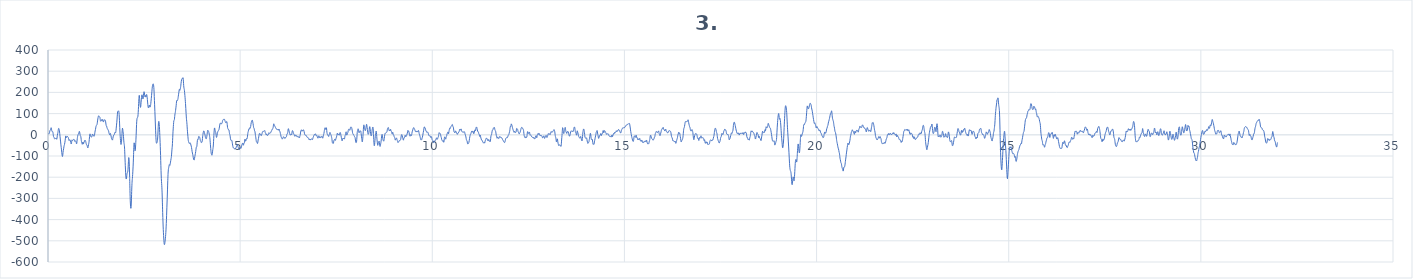
| Category | 3. kanál |
|---|---|
| 0.0 | 8.9 |
| 0.0078125 | 4.5 |
| 0.015625 | 3.4 |
| 0.0234375 | 4.8 |
| 0.03125 | 5.8 |
| 0.0390625 | 10 |
| 0.046875 | 17.3 |
| 0.0546875 | 22 |
| 0.0625 | 23.2 |
| 0.0703125 | 26.2 |
| 0.078125 | 32.6 |
| 0.0859375 | 32.5 |
| 0.09375 | 23.6 |
| 0.1015625 | 16.7 |
| 0.109375 | 14.8 |
| 0.1171875 | 15 |
| 0.125 | 14.3 |
| 0.1328125 | 6.5 |
| 0.140625 | -5.1 |
| 0.1484375 | -10.2 |
| 0.15625 | -11.9 |
| 0.1640625 | -16.3 |
| 0.171875 | -19.3 |
| 0.1796875 | -18.6 |
| 0.1875 | -17.9 |
| 0.1953125 | -17.7 |
| 0.203125 | -16.3 |
| 0.2109375 | -15.2 |
| 0.21875 | -18.2 |
| 0.2265625 | -21.1 |
| 0.234375 | -15.4 |
| 0.2421875 | -4.1 |
| 0.25 | 3.7 |
| 0.2578125 | 10.3 |
| 0.265625 | 20.6 |
| 0.2734375 | 29.1 |
| 0.28125 | 30 |
| 0.2890625 | 25.9 |
| 0.296875 | 18.6 |
| 0.3046875 | 6.9 |
| 0.3125 | -6.8 |
| 0.3203125 | -19.9 |
| 0.328125 | -33.7 |
| 0.3359375 | -47.4 |
| 0.34375 | -59.1 |
| 0.3515625 | -71.2 |
| 0.359375 | -84.5 |
| 0.3671875 | -96.1 |
| 0.375 | -102.6 |
| 0.3828125 | -97.8 |
| 0.390625 | -84 |
| 0.3984375 | -73.3 |
| 0.40625 | -66 |
| 0.4140625 | -56.6 |
| 0.421875 | -50.1 |
| 0.4296875 | -45.3 |
| 0.4375 | -37.5 |
| 0.4453125 | -28.2 |
| 0.453125 | -15.8 |
| 0.4609375 | -5.7 |
| 0.46875 | -7.7 |
| 0.4765625 | -12.8 |
| 0.484375 | -11.9 |
| 0.4921875 | -9.1 |
| 0.5 | -7.3 |
| 0.5078125 | -8 |
| 0.515625 | -10.1 |
| 0.5234375 | -10.9 |
| 0.53125 | -14.6 |
| 0.5390625 | -22.3 |
| 0.546875 | -27.1 |
| 0.5546875 | -26 |
| 0.5625 | -23.3 |
| 0.5703125 | -23.4 |
| 0.578125 | -25.6 |
| 0.5859375 | -29.1 |
| 0.59375 | -35.8 |
| 0.6015625 | -43 |
| 0.609375 | -41.6 |
| 0.6171875 | -31 |
| 0.625 | -23.9 |
| 0.6328125 | -26.1 |
| 0.640625 | -27.3 |
| 0.6484375 | -24.3 |
| 0.65625 | -22.9 |
| 0.6640625 | -22.6 |
| 0.671875 | -21.4 |
| 0.6796875 | -21.6 |
| 0.6875 | -25.5 |
| 0.6953125 | -30.5 |
| 0.703125 | -30.8 |
| 0.7109375 | -28.4 |
| 0.71875 | -28.8 |
| 0.7265625 | -31 |
| 0.734375 | -36.5 |
| 0.7421875 | -42.8 |
| 0.75 | -38.4 |
| 0.7578125 | -24.7 |
| 0.765625 | -13.1 |
| 0.7734375 | -5.5 |
| 0.78125 | 0 |
| 0.7890625 | 2.4 |
| 0.796875 | 4.1 |
| 0.8046875 | 9.3 |
| 0.8125 | 15.5 |
| 0.8203125 | 15.4 |
| 0.828125 | 8 |
| 0.8359375 | -0.6 |
| 0.84375 | -5.3 |
| 0.8515625 | -7.3 |
| 0.859375 | -15 |
| 0.8671875 | -27.7 |
| 0.875 | -34.6 |
| 0.8828125 | -38.4 |
| 0.890625 | -44.6 |
| 0.8984375 | -42.2 |
| 0.90625 | -34.2 |
| 0.9140625 | -37.5 |
| 0.921875 | -43.7 |
| 0.9296875 | -38.3 |
| 0.9375 | -33.3 |
| 0.9453125 | -34.4 |
| 0.953125 | -30.3 |
| 0.9609375 | -24.8 |
| 0.96875 | -27 |
| 0.9765625 | -30 |
| 0.984375 | -33.1 |
| 0.9921875 | -40.7 |
| 1.0 | -46 |
| 1.0078125 | -46.6 |
| 1.015625 | -49.3 |
| 1.0234375 | -54.8 |
| 1.03125 | -60.5 |
| 1.0390625 | -61.7 |
| 1.046875 | -55.2 |
| 1.0546875 | -46.7 |
| 1.0625 | -39.7 |
| 1.0703125 | -30 |
| 1.078125 | -15.1 |
| 1.0859375 | -0.8 |
| 1.09375 | 4.4 |
| 1.1015625 | 1.3 |
| 1.109375 | -4.2 |
| 1.1171875 | -9.5 |
| 1.125 | -11.1 |
| 1.1328125 | -10.1 |
| 1.140625 | -9.7 |
| 1.1484375 | -4.2 |
| 1.15625 | 3.5 |
| 1.1640625 | 2.2 |
| 1.171875 | -2.1 |
| 1.1796875 | -2.2 |
| 1.1875 | -4 |
| 1.1953125 | -6.9 |
| 1.203125 | -6 |
| 1.2109375 | -0.4 |
| 1.21875 | 9.4 |
| 1.2265625 | 18.2 |
| 1.234375 | 24.1 |
| 1.2421875 | 32.2 |
| 1.25 | 40 |
| 1.2578125 | 43.5 |
| 1.265625 | 45.3 |
| 1.2734375 | 47.7 |
| 1.28125 | 54.4 |
| 1.2890625 | 65.4 |
| 1.296875 | 74.8 |
| 1.3046875 | 82.4 |
| 1.3125 | 88.5 |
| 1.3203125 | 89.6 |
| 1.328125 | 87 |
| 1.3359375 | 84.6 |
| 1.34375 | 84.4 |
| 1.3515625 | 81.6 |
| 1.359375 | 71.5 |
| 1.3671875 | 64.3 |
| 1.375 | 65.2 |
| 1.3828125 | 64.9 |
| 1.390625 | 66.8 |
| 1.3984375 | 71.9 |
| 1.40625 | 69.6 |
| 1.4140625 | 67.6 |
| 1.421875 | 72.2 |
| 1.4296875 | 69.6 |
| 1.4375 | 61.3 |
| 1.4453125 | 60.8 |
| 1.453125 | 65.7 |
| 1.4609375 | 68.6 |
| 1.46875 | 69.9 |
| 1.4765625 | 70.8 |
| 1.484375 | 70.7 |
| 1.4921875 | 67.9 |
| 1.5 | 61.1 |
| 1.5078125 | 50.9 |
| 1.515625 | 43.6 |
| 1.5234375 | 41.7 |
| 1.53125 | 37.2 |
| 1.5390625 | 30.4 |
| 1.546875 | 29.2 |
| 1.5546875 | 26.9 |
| 1.5625 | 21.4 |
| 1.5703125 | 20.9 |
| 1.578125 | 18 |
| 1.5859375 | 9.4 |
| 1.59375 | 4.5 |
| 1.6015625 | 0.9 |
| 1.609375 | 0.6 |
| 1.6171875 | 6.4 |
| 1.625 | 5.9 |
| 1.6328125 | -0.3 |
| 1.640625 | -5.6 |
| 1.6484375 | -14 |
| 1.65625 | -19.2 |
| 1.6640625 | -19.3 |
| 1.671875 | -23.7 |
| 1.6796875 | -24.7 |
| 1.6875 | -16.8 |
| 1.6953125 | -9.6 |
| 1.703125 | -4.9 |
| 1.7109375 | -1.3 |
| 1.71875 | -0.7 |
| 1.7265625 | 1.5 |
| 1.734375 | 7.2 |
| 1.7421875 | 11.3 |
| 1.75 | 10.3 |
| 1.7578125 | 9 |
| 1.765625 | 15.2 |
| 1.7734375 | 27.9 |
| 1.78125 | 42 |
| 1.7890625 | 57 |
| 1.796875 | 74.4 |
| 1.8046875 | 94.2 |
| 1.8125 | 108.6 |
| 1.8203125 | 111.4 |
| 1.828125 | 111.2 |
| 1.8359375 | 113.2 |
| 1.84375 | 109.7 |
| 1.8515625 | 95.6 |
| 1.859375 | 68.7 |
| 1.8671875 | 33.3 |
| 1.875 | 4.1 |
| 1.8828125 | -17.2 |
| 1.890625 | -36.2 |
| 1.8984375 | -45.5 |
| 1.90625 | -42.2 |
| 1.9140625 | -30.2 |
| 1.921875 | -7.1 |
| 1.9296875 | 19 |
| 1.9375 | 31.1 |
| 1.9453125 | 26.1 |
| 1.953125 | 14.7 |
| 1.9609375 | 0.7 |
| 1.96875 | -19.3 |
| 1.9765625 | -37.1 |
| 1.984375 | -46.3 |
| 1.9921875 | -62.6 |
| 2.0 | -94.5 |
| 2.0078125 | -129.5 |
| 2.015625 | -161.6 |
| 2.0234375 | -189.7 |
| 2.03125 | -205.9 |
| 2.0390625 | -208 |
| 2.046875 | -199 |
| 2.0546875 | -185.6 |
| 2.0625 | -178.5 |
| 2.0703125 | -177.5 |
| 2.078125 | -170.5 |
| 2.0859375 | -151.7 |
| 2.09375 | -125.5 |
| 2.1015625 | -107.3 |
| 2.109375 | -115.5 |
| 2.1171875 | -150.2 |
| 2.125 | -201.7 |
| 2.1328125 | -261.9 |
| 2.140625 | -311.4 |
| 2.1484375 | -337.4 |
| 2.15625 | -346.9 |
| 2.1640625 | -337.6 |
| 2.171875 | -302.1 |
| 2.1796875 | -256 |
| 2.1875 | -223.4 |
| 2.1953125 | -206 |
| 2.203125 | -187.1 |
| 2.2109375 | -161.4 |
| 2.21875 | -132.6 |
| 2.2265625 | -93.5 |
| 2.234375 | -53.4 |
| 2.2421875 | -37.8 |
| 2.25 | -45.3 |
| 2.2578125 | -61.3 |
| 2.265625 | -75.3 |
| 2.2734375 | -70.3 |
| 2.28125 | -47.5 |
| 2.2890625 | -20.6 |
| 2.296875 | 13.3 |
| 2.3046875 | 48.7 |
| 2.3125 | 70.4 |
| 2.3203125 | 79.4 |
| 2.328125 | 81.6 |
| 2.3359375 | 83.4 |
| 2.34375 | 95.3 |
| 2.3515625 | 118.5 |
| 2.359375 | 148.3 |
| 2.3671875 | 176.6 |
| 2.375 | 186.1 |
| 2.3828125 | 173.8 |
| 2.390625 | 155.2 |
| 2.3984375 | 138.9 |
| 2.40625 | 129.3 |
| 2.4140625 | 135.4 |
| 2.421875 | 151.9 |
| 2.4296875 | 168.2 |
| 2.4375 | 182.7 |
| 2.4453125 | 188.7 |
| 2.453125 | 183.4 |
| 2.4609375 | 175.1 |
| 2.46875 | 168.9 |
| 2.4765625 | 171.8 |
| 2.484375 | 186.5 |
| 2.4921875 | 199.3 |
| 2.5 | 203.3 |
| 2.5078125 | 198.5 |
| 2.515625 | 185.5 |
| 2.5234375 | 179.6 |
| 2.53125 | 185.3 |
| 2.5390625 | 184.6 |
| 2.546875 | 177.9 |
| 2.5546875 | 181 |
| 2.5625 | 189.4 |
| 2.5703125 | 189.3 |
| 2.578125 | 180.6 |
| 2.5859375 | 166.9 |
| 2.59375 | 150.1 |
| 2.6015625 | 136.3 |
| 2.609375 | 129 |
| 2.6171875 | 126.6 |
| 2.625 | 131.1 |
| 2.6328125 | 139.1 |
| 2.640625 | 139.7 |
| 2.6484375 | 133.6 |
| 2.65625 | 130.6 |
| 2.6640625 | 133.6 |
| 2.671875 | 142.4 |
| 2.6796875 | 155.8 |
| 2.6875 | 170.6 |
| 2.6953125 | 185.9 |
| 2.703125 | 203 |
| 2.7109375 | 219.8 |
| 2.71875 | 231.5 |
| 2.7265625 | 237.8 |
| 2.734375 | 240.5 |
| 2.7421875 | 238.4 |
| 2.75 | 230.6 |
| 2.7578125 | 212.3 |
| 2.765625 | 180.3 |
| 2.7734375 | 144.3 |
| 2.78125 | 110.6 |
| 2.7890625 | 74.5 |
| 2.796875 | 36.9 |
| 2.8046875 | 1.6 |
| 2.8125 | -26 |
| 2.8203125 | -38.7 |
| 2.828125 | -39.5 |
| 2.8359375 | -36.9 |
| 2.84375 | -31.8 |
| 2.8515625 | -20.3 |
| 2.859375 | 2.5 |
| 2.8671875 | 33.1 |
| 2.875 | 56.2 |
| 2.8828125 | 63.6 |
| 2.890625 | 57.7 |
| 2.8984375 | 39.4 |
| 2.90625 | 11.5 |
| 2.9140625 | -20 |
| 2.921875 | -55.2 |
| 2.9296875 | -97.9 |
| 2.9375 | -145.7 |
| 2.9453125 | -189.5 |
| 2.953125 | -219.6 |
| 2.9609375 | -239.8 |
| 2.96875 | -270.4 |
| 2.9765625 | -317.7 |
| 2.984375 | -367.1 |
| 2.9921875 | -411.1 |
| 3.0 | -447.5 |
| 3.0078125 | -474.8 |
| 3.015625 | -497.8 |
| 3.0234375 | -514.3 |
| 3.03125 | -518.1 |
| 3.0390625 | -512.4 |
| 3.046875 | -501.6 |
| 3.0546875 | -487.8 |
| 3.0625 | -471.3 |
| 3.0703125 | -448.6 |
| 3.078125 | -418.6 |
| 3.0859375 | -381.9 |
| 3.09375 | -341.7 |
| 3.1015625 | -302.3 |
| 3.109375 | -260 |
| 3.1171875 | -215.3 |
| 3.125 | -180.7 |
| 3.1328125 | -162.8 |
| 3.140625 | -155.4 |
| 3.1484375 | -147.8 |
| 3.15625 | -140.9 |
| 3.1640625 | -142.5 |
| 3.171875 | -144 |
| 3.1796875 | -137.1 |
| 3.1875 | -128.7 |
| 3.1953125 | -120.6 |
| 3.203125 | -112.4 |
| 3.2109375 | -103 |
| 3.21875 | -85.8 |
| 3.2265625 | -67.7 |
| 3.234375 | -53.2 |
| 3.2421875 | -27.8 |
| 3.25 | 4.2 |
| 3.2578125 | 27.8 |
| 3.265625 | 48.4 |
| 3.2734375 | 64.8 |
| 3.28125 | 68.3 |
| 3.2890625 | 72.2 |
| 3.296875 | 86.4 |
| 3.3046875 | 98.4 |
| 3.3125 | 105.1 |
| 3.3203125 | 115.5 |
| 3.328125 | 127.1 |
| 3.3359375 | 139.5 |
| 3.34375 | 154.7 |
| 3.3515625 | 161.7 |
| 3.359375 | 160 |
| 3.3671875 | 161.8 |
| 3.375 | 165.3 |
| 3.3828125 | 170.9 |
| 3.390625 | 182.2 |
| 3.3984375 | 191.5 |
| 3.40625 | 201.1 |
| 3.4140625 | 212.8 |
| 3.421875 | 213.8 |
| 3.4296875 | 209.5 |
| 3.4375 | 213.2 |
| 3.4453125 | 219.6 |
| 3.453125 | 228 |
| 3.4609375 | 240.8 |
| 3.46875 | 252 |
| 3.4765625 | 259.9 |
| 3.484375 | 264.8 |
| 3.4921875 | 265.1 |
| 3.5 | 265.2 |
| 3.5078125 | 268.7 |
| 3.515625 | 268 |
| 3.5234375 | 253.3 |
| 3.53125 | 231.8 |
| 3.5390625 | 219.9 |
| 3.546875 | 213.4 |
| 3.5546875 | 200.7 |
| 3.5625 | 184.8 |
| 3.5703125 | 168 |
| 3.578125 | 147.2 |
| 3.5859375 | 124.2 |
| 3.59375 | 100 |
| 3.6015625 | 78.3 |
| 3.609375 | 64 |
| 3.6171875 | 48.1 |
| 3.625 | 26.3 |
| 3.6328125 | 8.4 |
| 3.640625 | -7 |
| 3.6484375 | -23 |
| 3.65625 | -31.1 |
| 3.6640625 | -34.1 |
| 3.671875 | -39.1 |
| 3.6796875 | -41.3 |
| 3.6875 | -39.6 |
| 3.6953125 | -38.3 |
| 3.703125 | -38.3 |
| 3.7109375 | -42.2 |
| 3.71875 | -48.4 |
| 3.7265625 | -53.1 |
| 3.734375 | -59.4 |
| 3.7421875 | -68.6 |
| 3.75 | -78.2 |
| 3.7578125 | -86 |
| 3.765625 | -91.7 |
| 3.7734375 | -99.3 |
| 3.78125 | -108.7 |
| 3.7890625 | -115 |
| 3.796875 | -118.7 |
| 3.8046875 | -118.9 |
| 3.8125 | -112.5 |
| 3.8203125 | -103.5 |
| 3.828125 | -95.1 |
| 3.8359375 | -87.3 |
| 3.84375 | -79.2 |
| 3.8515625 | -67.8 |
| 3.859375 | -58.7 |
| 3.8671875 | -57.7 |
| 3.875 | -52.4 |
| 3.8828125 | -34.9 |
| 3.890625 | -22.8 |
| 3.8984375 | -23.6 |
| 3.90625 | -22.1 |
| 3.9140625 | -13.8 |
| 3.921875 | -8.1 |
| 3.9296875 | -7.5 |
| 3.9375 | -9.2 |
| 3.9453125 | -11.4 |
| 3.953125 | -16.3 |
| 3.9609375 | -24.1 |
| 3.96875 | -28.3 |
| 3.9765625 | -30.6 |
| 3.984375 | -35.7 |
| 3.9921875 | -37.2 |
| 4.0 | -35.6 |
| 4.0078125 | -34.5 |
| 4.015625 | -25 |
| 4.0234375 | -9.8 |
| 4.03125 | 1.1 |
| 4.0390625 | 9.6 |
| 4.046875 | 16.2 |
| 4.0546875 | 18.6 |
| 4.0625 | 16.8 |
| 4.0703125 | 10.8 |
| 4.078125 | 4.9 |
| 4.0859375 | -1.1 |
| 4.09375 | -9.7 |
| 4.1015625 | -15.6 |
| 4.109375 | -17.9 |
| 4.1171875 | -19.1 |
| 4.125 | -15.2 |
| 4.1328125 | -7.4 |
| 4.140625 | 2.7 |
| 4.1484375 | 15 |
| 4.15625 | 21.7 |
| 4.1640625 | 20.2 |
| 4.171875 | 18 |
| 4.1796875 | 15.7 |
| 4.1875 | 10.4 |
| 4.1953125 | 3.4 |
| 4.203125 | -3.8 |
| 4.2109375 | -13.4 |
| 4.21875 | -28.3 |
| 4.2265625 | -46.8 |
| 4.234375 | -64.6 |
| 4.2421875 | -79.9 |
| 4.25 | -89.8 |
| 4.2578125 | -94 |
| 4.265625 | -96.4 |
| 4.2734375 | -92.8 |
| 4.28125 | -80.4 |
| 4.2890625 | -69.4 |
| 4.296875 | -60.5 |
| 4.3046875 | -43.2 |
| 4.3125 | -17.5 |
| 4.3203125 | 8.5 |
| 4.328125 | 27.2 |
| 4.3359375 | 32.4 |
| 4.34375 | 25.6 |
| 4.3515625 | 17.8 |
| 4.359375 | 15.1 |
| 4.3671875 | 9.6 |
| 4.375 | -3.1 |
| 4.3828125 | -12.1 |
| 4.390625 | -10.4 |
| 4.3984375 | -3 |
| 4.40625 | 5.3 |
| 4.4140625 | 11.7 |
| 4.421875 | 16.4 |
| 4.4296875 | 19.7 |
| 4.4375 | 20.7 |
| 4.4453125 | 22.4 |
| 4.453125 | 28.3 |
| 4.4609375 | 37 |
| 4.46875 | 45.8 |
| 4.4765625 | 52 |
| 4.484375 | 55.3 |
| 4.4921875 | 55.8 |
| 4.5 | 52.7 |
| 4.5078125 | 50.9 |
| 4.515625 | 52.8 |
| 4.5234375 | 53.2 |
| 4.53125 | 55.2 |
| 4.5390625 | 62.8 |
| 4.546875 | 68.3 |
| 4.5546875 | 69.7 |
| 4.5625 | 72.5 |
| 4.5703125 | 73.8 |
| 4.578125 | 71.9 |
| 4.5859375 | 72.2 |
| 4.59375 | 72.8 |
| 4.6015625 | 68.3 |
| 4.609375 | 63.4 |
| 4.6171875 | 60.9 |
| 4.625 | 57.7 |
| 4.6328125 | 56.7 |
| 4.640625 | 60.2 |
| 4.6484375 | 62.8 |
| 4.65625 | 59.7 |
| 4.6640625 | 48.7 |
| 4.671875 | 34.9 |
| 4.6796875 | 29.2 |
| 4.6875 | 28 |
| 4.6953125 | 23.9 |
| 4.703125 | 23.2 |
| 4.7109375 | 21.8 |
| 4.71875 | 11.1 |
| 4.7265625 | 2.9 |
| 4.734375 | -0.2 |
| 4.7421875 | -10.1 |
| 4.75 | -21.4 |
| 4.7578125 | -25.9 |
| 4.765625 | -26.9 |
| 4.7734375 | -26.1 |
| 4.78125 | -25.6 |
| 4.7890625 | -30.4 |
| 4.796875 | -39.6 |
| 4.8046875 | -48.7 |
| 4.8125 | -55.6 |
| 4.8203125 | -60.6 |
| 4.828125 | -62.4 |
| 4.8359375 | -61.6 |
| 4.84375 | -63.2 |
| 4.8515625 | -66.2 |
| 4.859375 | -67.1 |
| 4.8671875 | -66.3 |
| 4.875 | -64.5 |
| 4.8828125 | -63.8 |
| 4.890625 | -63.1 |
| 4.8984375 | -57.8 |
| 4.90625 | -53.8 |
| 4.9140625 | -53.3 |
| 4.921875 | -47.8 |
| 4.9296875 | -45 |
| 4.9375 | -52.1 |
| 4.9453125 | -57.8 |
| 4.953125 | -59.9 |
| 4.9609375 | -64.2 |
| 4.96875 | -67.3 |
| 4.9765625 | -68.4 |
| 4.984375 | -69 |
| 4.9921875 | -66.1 |
| 5.0 | -61.9 |
| 5.0078125 | -60.4 |
| 5.015625 | -61.9 |
| 5.0234375 | -63.8 |
| 5.03125 | -60.5 |
| 5.0390625 | -52.5 |
| 5.046875 | -46.7 |
| 5.0546875 | -42.9 |
| 5.0625 | -39.1 |
| 5.0703125 | -40.1 |
| 5.078125 | -46.7 |
| 5.0859375 | -49.1 |
| 5.09375 | -42.9 |
| 5.1015625 | -38.6 |
| 5.109375 | -37.8 |
| 5.1171875 | -29.8 |
| 5.125 | -20.7 |
| 5.1328125 | -23.2 |
| 5.140625 | -29.6 |
| 5.1484375 | -29.3 |
| 5.15625 | -23.4 |
| 5.1640625 | -18.2 |
| 5.171875 | -18.7 |
| 5.1796875 | -19.3 |
| 5.1875 | -12.3 |
| 5.1953125 | 0.2 |
| 5.203125 | 10.1 |
| 5.2109375 | 15.5 |
| 5.21875 | 22.1 |
| 5.2265625 | 27.9 |
| 5.234375 | 26.5 |
| 5.2421875 | 27.3 |
| 5.25 | 33.3 |
| 5.2578125 | 32.6 |
| 5.265625 | 31.4 |
| 5.2734375 | 38.8 |
| 5.28125 | 48.7 |
| 5.2890625 | 57.7 |
| 5.296875 | 63.6 |
| 5.3046875 | 66.2 |
| 5.3125 | 69.5 |
| 5.3203125 | 67.8 |
| 5.328125 | 60.2 |
| 5.3359375 | 53.2 |
| 5.34375 | 43 |
| 5.3515625 | 34 |
| 5.359375 | 32.1 |
| 5.3671875 | 26.6 |
| 5.375 | 19.3 |
| 5.3828125 | 16.7 |
| 5.390625 | 8.5 |
| 5.3984375 | -3.1 |
| 5.40625 | -11 |
| 5.4140625 | -22 |
| 5.421875 | -32 |
| 5.4296875 | -33.5 |
| 5.4375 | -34.8 |
| 5.4453125 | -39.7 |
| 5.453125 | -40.9 |
| 5.4609375 | -34 |
| 5.46875 | -24.2 |
| 5.4765625 | -17.8 |
| 5.484375 | -9.9 |
| 5.4921875 | 0.1 |
| 5.5 | 5.5 |
| 5.5078125 | 7.3 |
| 5.515625 | 4.7 |
| 5.5234375 | -1.3 |
| 5.53125 | -0.9 |
| 5.5390625 | 0.9 |
| 5.546875 | -3.1 |
| 5.5546875 | -3.1 |
| 5.5625 | 1.7 |
| 5.5703125 | 6.1 |
| 5.578125 | 11.7 |
| 5.5859375 | 15.3 |
| 5.59375 | 15.1 |
| 5.6015625 | 15.2 |
| 5.609375 | 16.4 |
| 5.6171875 | 17.4 |
| 5.625 | 17.6 |
| 5.6328125 | 19.1 |
| 5.640625 | 19.9 |
| 5.6484375 | 14.7 |
| 5.65625 | 9.2 |
| 5.6640625 | 7.4 |
| 5.671875 | 2.6 |
| 5.6796875 | -0.8 |
| 5.6875 | 2.9 |
| 5.6953125 | 3.8 |
| 5.703125 | -1.7 |
| 5.7109375 | -4.3 |
| 5.71875 | -1.8 |
| 5.7265625 | -0.3 |
| 5.734375 | 1.1 |
| 5.7421875 | 6.5 |
| 5.75 | 10.2 |
| 5.7578125 | 7.9 |
| 5.765625 | 6.2 |
| 5.7734375 | 7.4 |
| 5.78125 | 8.6 |
| 5.7890625 | 9.2 |
| 5.796875 | 10.2 |
| 5.8046875 | 14.3 |
| 5.8125 | 18.7 |
| 5.8203125 | 19.7 |
| 5.828125 | 22.1 |
| 5.8359375 | 26.8 |
| 5.84375 | 28.7 |
| 5.8515625 | 29.6 |
| 5.859375 | 35.3 |
| 5.8671875 | 45.7 |
| 5.875 | 51.9 |
| 5.8828125 | 48.6 |
| 5.890625 | 44.4 |
| 5.8984375 | 43.4 |
| 5.90625 | 39.6 |
| 5.9140625 | 35.7 |
| 5.921875 | 34.5 |
| 5.9296875 | 31.4 |
| 5.9375 | 27.9 |
| 5.9453125 | 26.7 |
| 5.953125 | 25.9 |
| 5.9609375 | 24.9 |
| 5.96875 | 23.4 |
| 5.9765625 | 24.4 |
| 5.984375 | 27.4 |
| 5.9921875 | 24.8 |
| 6.0 | 21.4 |
| 6.0078125 | 25.4 |
| 6.015625 | 26.3 |
| 6.0234375 | 20.4 |
| 6.03125 | 16.8 |
| 6.0390625 | 12.8 |
| 6.046875 | 6.4 |
| 6.0546875 | 1.1 |
| 6.0625 | -6.3 |
| 6.0703125 | -12.4 |
| 6.078125 | -13.1 |
| 6.0859375 | -16.1 |
| 6.09375 | -20.3 |
| 6.1015625 | -19.5 |
| 6.109375 | -17 |
| 6.1171875 | -13.2 |
| 6.125 | -9.1 |
| 6.1328125 | -10.5 |
| 6.140625 | -12.8 |
| 6.1484375 | -12.4 |
| 6.15625 | -14.7 |
| 6.1640625 | -17.5 |
| 6.171875 | -15.7 |
| 6.1796875 | -13 |
| 6.1875 | -12.5 |
| 6.1953125 | -11.8 |
| 6.203125 | -9.1 |
| 6.2109375 | -2.8 |
| 6.21875 | 4.1 |
| 6.2265625 | 5.5 |
| 6.234375 | 6.4 |
| 6.2421875 | 16 |
| 6.25 | 26.9 |
| 6.2578125 | 28.7 |
| 6.265625 | 23.5 |
| 6.2734375 | 17.3 |
| 6.28125 | 12 |
| 6.2890625 | 6.6 |
| 6.296875 | 1.1 |
| 6.3046875 | -1.7 |
| 6.3125 | -1 |
| 6.3203125 | 1.6 |
| 6.328125 | 1.9 |
| 6.3359375 | -0.9 |
| 6.34375 | 2.6 |
| 6.3515625 | 13.4 |
| 6.359375 | 19.6 |
| 6.3671875 | 19.1 |
| 6.375 | 16.3 |
| 6.3828125 | 11.2 |
| 6.390625 | 6.2 |
| 6.3984375 | 3.3 |
| 6.40625 | 0.2 |
| 6.4140625 | -3.6 |
| 6.421875 | -6.8 |
| 6.4296875 | -6.5 |
| 6.4375 | -3 |
| 6.4453125 | -0.8 |
| 6.453125 | -1 |
| 6.4609375 | -3.2 |
| 6.46875 | -7.1 |
| 6.4765625 | -7.4 |
| 6.484375 | -6.6 |
| 6.4921875 | -9.6 |
| 6.5 | -9.8 |
| 6.5078125 | -8.1 |
| 6.515625 | -10.5 |
| 6.5234375 | -10.8 |
| 6.53125 | -11.2 |
| 6.5390625 | -15.1 |
| 6.546875 | -12 |
| 6.5546875 | -5.3 |
| 6.5625 | -1.3 |
| 6.5703125 | 8.7 |
| 6.578125 | 18.2 |
| 6.5859375 | 20.3 |
| 6.59375 | 23.4 |
| 6.6015625 | 22.4 |
| 6.609375 | 16.8 |
| 6.6171875 | 18.3 |
| 6.625 | 20.1 |
| 6.6328125 | 18.4 |
| 6.640625 | 21.8 |
| 6.6484375 | 23.9 |
| 6.65625 | 20.6 |
| 6.6640625 | 16 |
| 6.671875 | 8.1 |
| 6.6796875 | 1.7 |
| 6.6875 | 0.6 |
| 6.6953125 | -1.3 |
| 6.703125 | -2 |
| 6.7109375 | -0.9 |
| 6.71875 | -4.1 |
| 6.7265625 | -7.3 |
| 6.734375 | -8.4 |
| 6.7421875 | -11.7 |
| 6.75 | -13 |
| 6.7578125 | -11.8 |
| 6.765625 | -12.9 |
| 6.7734375 | -13.9 |
| 6.78125 | -16 |
| 6.7890625 | -21.6 |
| 6.796875 | -23.2 |
| 6.8046875 | -20 |
| 6.8125 | -20.7 |
| 6.8203125 | -24.4 |
| 6.828125 | -24.4 |
| 6.8359375 | -21.1 |
| 6.84375 | -19.7 |
| 6.8515625 | -20.6 |
| 6.859375 | -19.7 |
| 6.8671875 | -18.8 |
| 6.875 | -21.8 |
| 6.8828125 | -22.7 |
| 6.890625 | -18.1 |
| 6.8984375 | -13 |
| 6.90625 | -9.4 |
| 6.9140625 | -6.1 |
| 6.921875 | -2.2 |
| 6.9296875 | 1.2 |
| 6.9375 | 0.6 |
| 6.9453125 | 0 |
| 6.953125 | 3.5 |
| 6.9609375 | 4.6 |
| 6.96875 | 0.7 |
| 6.9765625 | -3.7 |
| 6.984375 | -5.5 |
| 6.9921875 | -3.6 |
| 7.0 | -3.6 |
| 7.0078125 | -9 |
| 7.015625 | -13.9 |
| 7.0234375 | -15.8 |
| 7.03125 | -14.9 |
| 7.0390625 | -9.9 |
| 7.046875 | -4.9 |
| 7.0546875 | -5.5 |
| 7.0625 | -11.5 |
| 7.0703125 | -14 |
| 7.078125 | -9.8 |
| 7.0859375 | -9.8 |
| 7.09375 | -13.2 |
| 7.1015625 | -11.7 |
| 7.109375 | -10.6 |
| 7.1171875 | -10.8 |
| 7.125 | -7.6 |
| 7.1328125 | -7.6 |
| 7.140625 | -13.1 |
| 7.1484375 | -16.1 |
| 7.15625 | -12.5 |
| 7.1640625 | -4.9 |
| 7.171875 | 1.2 |
| 7.1796875 | 6.2 |
| 7.1875 | 14.7 |
| 7.1953125 | 25 |
| 7.203125 | 31.5 |
| 7.2109375 | 33.1 |
| 7.21875 | 30.3 |
| 7.2265625 | 25.2 |
| 7.234375 | 26.9 |
| 7.2421875 | 33.5 |
| 7.25 | 27.7 |
| 7.2578125 | 12.2 |
| 7.265625 | 4.1 |
| 7.2734375 | 0.8 |
| 7.28125 | -2 |
| 7.2890625 | -2.5 |
| 7.296875 | -6.2 |
| 7.3046875 | -7.8 |
| 7.3125 | -1.8 |
| 7.3203125 | 2.6 |
| 7.328125 | 6.2 |
| 7.3359375 | 11.3 |
| 7.34375 | 9.1 |
| 7.3515625 | 3.3 |
| 7.359375 | 1.3 |
| 7.3671875 | -2.2 |
| 7.375 | -8.1 |
| 7.3828125 | -13.7 |
| 7.390625 | -23.4 |
| 7.3984375 | -35.2 |
| 7.40625 | -39.3 |
| 7.4140625 | -38.4 |
| 7.421875 | -40.6 |
| 7.4296875 | -38.3 |
| 7.4375 | -28.6 |
| 7.4453125 | -24.7 |
| 7.453125 | -24.4 |
| 7.4609375 | -20.7 |
| 7.46875 | -22.3 |
| 7.4765625 | -26.6 |
| 7.484375 | -23.8 |
| 7.4921875 | -18.6 |
| 7.5 | -14.3 |
| 7.5078125 | -9.7 |
| 7.515625 | -4.1 |
| 7.5234375 | 3.9 |
| 7.53125 | 8.1 |
| 7.5390625 | 3.8 |
| 7.546875 | 0 |
| 7.5546875 | 2.1 |
| 7.5625 | 3.3 |
| 7.5703125 | 0 |
| 7.578125 | -2 |
| 7.5859375 | 1.8 |
| 7.59375 | 8 |
| 7.6015625 | 11.1 |
| 7.609375 | 9.3 |
| 7.6171875 | 3.3 |
| 7.625 | -4.6 |
| 7.6328125 | -11.9 |
| 7.640625 | -18.9 |
| 7.6484375 | -26.6 |
| 7.65625 | -28.2 |
| 7.6640625 | -21 |
| 7.671875 | -17 |
| 7.6796875 | -19 |
| 7.6875 | -17.7 |
| 7.6953125 | -15.2 |
| 7.703125 | -17.6 |
| 7.7109375 | -20.5 |
| 7.71875 | -16.4 |
| 7.7265625 | -7 |
| 7.734375 | -2.1 |
| 7.7421875 | 0.8 |
| 7.75 | 10.1 |
| 7.7578125 | 14.1 |
| 7.765625 | 5.5 |
| 7.7734375 | -1.4 |
| 7.78125 | 0.1 |
| 7.7890625 | 4.1 |
| 7.796875 | 7.4 |
| 7.8046875 | 12 |
| 7.8125 | 20.1 |
| 7.8203125 | 25.6 |
| 7.828125 | 25.3 |
| 7.8359375 | 25.2 |
| 7.84375 | 24.3 |
| 7.8515625 | 21.2 |
| 7.859375 | 23.9 |
| 7.8671875 | 31.9 |
| 7.875 | 36.2 |
| 7.8828125 | 36.4 |
| 7.890625 | 36.3 |
| 7.8984375 | 35.1 |
| 7.90625 | 30.3 |
| 7.9140625 | 22.5 |
| 7.921875 | 13.6 |
| 7.9296875 | 6.7 |
| 7.9375 | 3.7 |
| 7.9453125 | 1.5 |
| 7.953125 | -1.2 |
| 7.9609375 | -2.5 |
| 7.96875 | -4.9 |
| 7.9765625 | -8.7 |
| 7.984375 | -10.7 |
| 7.9921875 | -14.4 |
| 8.0 | -24.8 |
| 8.0078125 | -34.6 |
| 8.015625 | -37 |
| 8.0234375 | -35.9 |
| 8.03125 | -29.7 |
| 8.0390625 | -10.6 |
| 8.046875 | 10.6 |
| 8.0546875 | 19.3 |
| 8.0625 | 23.6 |
| 8.0703125 | 28.4 |
| 8.078125 | 24 |
| 8.0859375 | 14 |
| 8.09375 | 9.5 |
| 8.1015625 | 10.9 |
| 8.109375 | 15.8 |
| 8.1171875 | 18.8 |
| 8.125 | 17.6 |
| 8.1328125 | 18.2 |
| 8.140625 | 16.7 |
| 8.1484375 | 5.6 |
| 8.15625 | -6.5 |
| 8.1640625 | -16.3 |
| 8.171875 | -28.6 |
| 8.1796875 | -33.5 |
| 8.1875 | -23.8 |
| 8.1953125 | -7.2 |
| 8.203125 | 14.1 |
| 8.2109375 | 36.7 |
| 8.21875 | 46.8 |
| 8.2265625 | 41.6 |
| 8.234375 | 33.8 |
| 8.2421875 | 28.5 |
| 8.25 | 22.5 |
| 8.2578125 | 19.2 |
| 8.265625 | 23.1 |
| 8.2734375 | 31.4 |
| 8.28125 | 42.2 |
| 8.2890625 | 49.6 |
| 8.296875 | 45.4 |
| 8.3046875 | 35.2 |
| 8.3125 | 24.9 |
| 8.3203125 | 11.7 |
| 8.328125 | 2.7 |
| 8.3359375 | 2.7 |
| 8.34375 | 4.7 |
| 8.3515625 | 11.6 |
| 8.359375 | 26.2 |
| 8.3671875 | 36.9 |
| 8.375 | 37.9 |
| 8.3828125 | 30.5 |
| 8.390625 | 15.3 |
| 8.3984375 | 1.4 |
| 8.40625 | -4 |
| 8.4140625 | -4.9 |
| 8.421875 | 0.8 |
| 8.4296875 | 14.7 |
| 8.4375 | 25.7 |
| 8.4453125 | 31.7 |
| 8.453125 | 36.8 |
| 8.4609375 | 30.5 |
| 8.46875 | 7.3 |
| 8.4765625 | -22.1 |
| 8.484375 | -44.9 |
| 8.4921875 | -51.8 |
| 8.5 | -43.6 |
| 8.5078125 | -27.4 |
| 8.515625 | -9.4 |
| 8.5234375 | 2.6 |
| 8.53125 | 10.6 |
| 8.5390625 | 17.6 |
| 8.546875 | 11.1 |
| 8.5546875 | -8 |
| 8.5625 | -24.1 |
| 8.5703125 | -38.2 |
| 8.578125 | -49.2 |
| 8.5859375 | -47.6 |
| 8.59375 | -40.4 |
| 8.6015625 | -36.6 |
| 8.609375 | -32.1 |
| 8.6171875 | -29.9 |
| 8.625 | -37.4 |
| 8.6328125 | -49.3 |
| 8.640625 | -55 |
| 8.6484375 | -51 |
| 8.65625 | -43.1 |
| 8.6640625 | -35.4 |
| 8.671875 | -24.1 |
| 8.6796875 | -10.2 |
| 8.6875 | -0.8 |
| 8.6953125 | 1.9 |
| 8.703125 | -4.1 |
| 8.7109375 | -16.4 |
| 8.71875 | -24.4 |
| 8.7265625 | -27.4 |
| 8.734375 | -30.2 |
| 8.7421875 | -27.4 |
| 8.75 | -17.5 |
| 8.7578125 | -6.7 |
| 8.765625 | 2 |
| 8.7734375 | 7.2 |
| 8.78125 | 8.2 |
| 8.7890625 | 7.9 |
| 8.796875 | 9.2 |
| 8.8046875 | 11 |
| 8.8125 | 11.5 |
| 8.8203125 | 14.4 |
| 8.828125 | 22.2 |
| 8.8359375 | 29.5 |
| 8.84375 | 32.5 |
| 8.8515625 | 34.2 |
| 8.859375 | 33.5 |
| 8.8671875 | 26.3 |
| 8.875 | 20.4 |
| 8.8828125 | 21.6 |
| 8.890625 | 20.8 |
| 8.8984375 | 18 |
| 8.90625 | 22.6 |
| 8.9140625 | 26.4 |
| 8.921875 | 21.3 |
| 8.9296875 | 16.9 |
| 8.9375 | 15.5 |
| 8.9453125 | 10.1 |
| 8.953125 | 4.6 |
| 8.9609375 | 6.9 |
| 8.96875 | 12.2 |
| 8.9765625 | 8.9 |
| 8.984375 | 0.4 |
| 8.9921875 | -1.6 |
| 9.0 | -2.3 |
| 9.0078125 | -8.8 |
| 9.015625 | -12 |
| 9.0234375 | -13.2 |
| 9.03125 | -21.3 |
| 9.0390625 | -25.2 |
| 9.046875 | -20.1 |
| 9.0546875 | -17.7 |
| 9.0625 | -16.4 |
| 9.0703125 | -14.9 |
| 9.078125 | -20.4 |
| 9.0859375 | -25.9 |
| 9.09375 | -27.9 |
| 9.1015625 | -33.6 |
| 9.109375 | -36.9 |
| 9.1171875 | -34.3 |
| 9.125 | -32.4 |
| 9.1328125 | -30 |
| 9.140625 | -27.1 |
| 9.1484375 | -27.7 |
| 9.15625 | -27.8 |
| 9.1640625 | -25.5 |
| 9.171875 | -24.2 |
| 9.1796875 | -20.1 |
| 9.1875 | -10.4 |
| 9.1953125 | -2 |
| 9.203125 | 1 |
| 9.2109375 | -0.1 |
| 9.21875 | -5.5 |
| 9.2265625 | -11 |
| 9.234375 | -15.7 |
| 9.2421875 | -23.2 |
| 9.25 | -25.2 |
| 9.2578125 | -18 |
| 9.265625 | -13.8 |
| 9.2734375 | -14.2 |
| 9.28125 | -10.8 |
| 9.2890625 | -4.2 |
| 9.296875 | -1.8 |
| 9.3046875 | -6.9 |
| 9.3125 | -9.6 |
| 9.3203125 | -6 |
| 9.328125 | -4.4 |
| 9.3359375 | -1.6 |
| 9.34375 | 4.2 |
| 9.3515625 | 8.5 |
| 9.359375 | 16.2 |
| 9.3671875 | 21.1 |
| 9.375 | 15.9 |
| 9.3828125 | 14.3 |
| 9.390625 | 15.6 |
| 9.3984375 | 8.5 |
| 9.40625 | 0.4 |
| 9.4140625 | -4.2 |
| 9.421875 | -6.7 |
| 9.4296875 | -3.4 |
| 9.4375 | 0.8 |
| 9.4453125 | -0.9 |
| 9.453125 | -4.2 |
| 9.4609375 | -2.1 |
| 9.46875 | 6 |
| 9.4765625 | 13.9 |
| 9.484375 | 18.3 |
| 9.4921875 | 22.9 |
| 9.5 | 28.4 |
| 9.5078125 | 32.2 |
| 9.515625 | 34 |
| 9.5234375 | 32.4 |
| 9.53125 | 28.8 |
| 9.5390625 | 26.3 |
| 9.546875 | 23.3 |
| 9.5546875 | 18.5 |
| 9.5625 | 15 |
| 9.5703125 | 15.5 |
| 9.578125 | 17.4 |
| 9.5859375 | 16.7 |
| 9.59375 | 14 |
| 9.6015625 | 13.9 |
| 9.609375 | 16.8 |
| 9.6171875 | 17.1 |
| 9.625 | 14.3 |
| 9.6328125 | 16.3 |
| 9.640625 | 20.6 |
| 9.6484375 | 16.4 |
| 9.65625 | 7.6 |
| 9.6640625 | 2.5 |
| 9.671875 | -1.7 |
| 9.6796875 | -6.9 |
| 9.6875 | -13.2 |
| 9.6953125 | -20.9 |
| 9.703125 | -23.9 |
| 9.7109375 | -23.7 |
| 9.71875 | -24.7 |
| 9.7265625 | -21.6 |
| 9.734375 | -15.4 |
| 9.7421875 | -11.2 |
| 9.75 | -5.4 |
| 9.7578125 | 3.5 |
| 9.765625 | 11.6 |
| 9.7734375 | 18.7 |
| 9.78125 | 27.7 |
| 9.7890625 | 36.5 |
| 9.796875 | 37.1 |
| 9.8046875 | 32 |
| 9.8125 | 31.8 |
| 9.8203125 | 30.3 |
| 9.828125 | 21.6 |
| 9.8359375 | 17 |
| 9.84375 | 17.5 |
| 9.8515625 | 13.9 |
| 9.859375 | 11.1 |
| 9.8671875 | 12.6 |
| 9.875 | 12.6 |
| 9.8828125 | 12.2 |
| 9.890625 | 10.8 |
| 9.8984375 | 4.1 |
| 9.90625 | -2.5 |
| 9.9140625 | -4.2 |
| 9.921875 | -4.8 |
| 9.9296875 | -4.5 |
| 9.9375 | -3.5 |
| 9.9453125 | -4.7 |
| 9.953125 | -8.6 |
| 9.9609375 | -12.8 |
| 9.96875 | -11.9 |
| 9.9765625 | -8.5 |
| 9.984375 | -12.1 |
| 9.9921875 | -20.2 |
| 10.0 | -24.5 |
| 10.0078125 | -26 |
| 10.015625 | -27.6 |
| 10.0234375 | -31 |
| 10.03125 | -36.2 |
| 10.0390625 | -38.1 |
| 10.046875 | -35.2 |
| 10.0546875 | -31.8 |
| 10.0625 | -30.1 |
| 10.0703125 | -27.4 |
| 10.078125 | -24.2 |
| 10.0859375 | -24.7 |
| 10.09375 | -24.7 |
| 10.1015625 | -18.6 |
| 10.109375 | -14.2 |
| 10.1171875 | -16.8 |
| 10.125 | -20.4 |
| 10.1328125 | -20.9 |
| 10.140625 | -17.4 |
| 10.1484375 | -13 |
| 10.15625 | -10.5 |
| 10.1640625 | -4.2 |
| 10.171875 | 6.1 |
| 10.1796875 | 10.3 |
| 10.1875 | 8 |
| 10.1953125 | 6.1 |
| 10.203125 | 6.1 |
| 10.2109375 | 4.6 |
| 10.21875 | -1.7 |
| 10.2265625 | -8.5 |
| 10.234375 | -12.6 |
| 10.2421875 | -19.3 |
| 10.25 | -26.2 |
| 10.2578125 | -27.1 |
| 10.265625 | -28.3 |
| 10.2734375 | -30.7 |
| 10.28125 | -27.9 |
| 10.2890625 | -28.2 |
| 10.296875 | -35.1 |
| 10.3046875 | -32.1 |
| 10.3125 | -17.6 |
| 10.3203125 | -9.9 |
| 10.328125 | -11 |
| 10.3359375 | -14.2 |
| 10.34375 | -19.8 |
| 10.3515625 | -20 |
| 10.359375 | -12 |
| 10.3671875 | -8 |
| 10.375 | -4.7 |
| 10.3828125 | 4.1 |
| 10.390625 | 7.1 |
| 10.3984375 | 7.4 |
| 10.40625 | 13.3 |
| 10.4140625 | 11.6 |
| 10.421875 | 4.8 |
| 10.4296875 | 10 |
| 10.4375 | 19.8 |
| 10.4453125 | 26.2 |
| 10.453125 | 32 |
| 10.4609375 | 32.1 |
| 10.46875 | 30.3 |
| 10.4765625 | 34.3 |
| 10.484375 | 38.4 |
| 10.4921875 | 40.1 |
| 10.5 | 42.3 |
| 10.5078125 | 44.8 |
| 10.515625 | 48.1 |
| 10.5234375 | 48.1 |
| 10.53125 | 42.4 |
| 10.5390625 | 38.5 |
| 10.546875 | 36.4 |
| 10.5546875 | 27.6 |
| 10.5625 | 16.4 |
| 10.5703125 | 13.1 |
| 10.578125 | 12.3 |
| 10.5859375 | 8.8 |
| 10.59375 | 11.4 |
| 10.6015625 | 18.1 |
| 10.609375 | 17.9 |
| 10.6171875 | 14.5 |
| 10.625 | 12.3 |
| 10.6328125 | 9 |
| 10.640625 | 5.6 |
| 10.6484375 | 2.3 |
| 10.65625 | 3.1 |
| 10.6640625 | 7.8 |
| 10.671875 | 8.4 |
| 10.6796875 | 8.8 |
| 10.6875 | 12.7 |
| 10.6953125 | 14.6 |
| 10.703125 | 18.3 |
| 10.7109375 | 24.7 |
| 10.71875 | 27.1 |
| 10.7265625 | 24.6 |
| 10.734375 | 21.6 |
| 10.7421875 | 24.4 |
| 10.75 | 27.8 |
| 10.7578125 | 22.9 |
| 10.765625 | 17.1 |
| 10.7734375 | 15.1 |
| 10.78125 | 13.4 |
| 10.7890625 | 13.3 |
| 10.796875 | 12.2 |
| 10.8046875 | 10.9 |
| 10.8125 | 13.7 |
| 10.8203125 | 14.6 |
| 10.828125 | 13.7 |
| 10.8359375 | 14.5 |
| 10.84375 | 11.2 |
| 10.8515625 | 4.9 |
| 10.859375 | 0 |
| 10.8671875 | -4.7 |
| 10.875 | -10.1 |
| 10.8828125 | -18.4 |
| 10.890625 | -25.7 |
| 10.8984375 | -26.6 |
| 10.90625 | -29.6 |
| 10.9140625 | -38.8 |
| 10.921875 | -43.7 |
| 10.9296875 | -42.2 |
| 10.9375 | -41.1 |
| 10.9453125 | -39.8 |
| 10.953125 | -34.9 |
| 10.9609375 | -27.6 |
| 10.96875 | -18.4 |
| 10.9765625 | -9.3 |
| 10.984375 | -3 |
| 10.9921875 | 1.6 |
| 11.0 | 4.5 |
| 11.0078125 | 6.9 |
| 11.015625 | 12.2 |
| 11.0234375 | 16.4 |
| 11.03125 | 17.7 |
| 11.0390625 | 17.7 |
| 11.046875 | 13.5 |
| 11.0546875 | 12.1 |
| 11.0625 | 16.2 |
| 11.0703125 | 12.1 |
| 11.078125 | 5.2 |
| 11.0859375 | 7.7 |
| 11.09375 | 12.6 |
| 11.1015625 | 18.3 |
| 11.109375 | 23.3 |
| 11.1171875 | 19.9 |
| 11.125 | 19.2 |
| 11.1328125 | 28 |
| 11.140625 | 34.2 |
| 11.1484375 | 36.7 |
| 11.15625 | 36.1 |
| 11.1640625 | 29.5 |
| 11.171875 | 23 |
| 11.1796875 | 17.8 |
| 11.1875 | 13.8 |
| 11.1953125 | 14 |
| 11.203125 | 11 |
| 11.2109375 | 4.9 |
| 11.21875 | 2.8 |
| 11.2265625 | -2.7 |
| 11.234375 | -8 |
| 11.2421875 | -3.4 |
| 11.25 | -1.6 |
| 11.2578125 | -9 |
| 11.265625 | -15.4 |
| 11.2734375 | -19.7 |
| 11.28125 | -24.2 |
| 11.2890625 | -26 |
| 11.296875 | -26.3 |
| 11.3046875 | -28.9 |
| 11.3125 | -33 |
| 11.3203125 | -35.3 |
| 11.328125 | -37.5 |
| 11.3359375 | -39.5 |
| 11.34375 | -37.2 |
| 11.3515625 | -36.1 |
| 11.359375 | -39.2 |
| 11.3671875 | -36.9 |
| 11.375 | -29.7 |
| 11.3828125 | -25.9 |
| 11.390625 | -23 |
| 11.3984375 | -18.4 |
| 11.40625 | -15.4 |
| 11.4140625 | -15.6 |
| 11.421875 | -17.7 |
| 11.4296875 | -20.1 |
| 11.4375 | -22.9 |
| 11.4453125 | -27.3 |
| 11.453125 | -28.6 |
| 11.4609375 | -24.4 |
| 11.46875 | -22 |
| 11.4765625 | -26 |
| 11.484375 | -30.1 |
| 11.4921875 | -29.7 |
| 11.5 | -30.5 |
| 11.5078125 | -32.6 |
| 11.515625 | -24.9 |
| 11.5234375 | -10.2 |
| 11.53125 | -3.1 |
| 11.5390625 | -0.9 |
| 11.546875 | 5.7 |
| 11.5546875 | 14.3 |
| 11.5625 | 21.1 |
| 11.5703125 | 22.6 |
| 11.578125 | 23.1 |
| 11.5859375 | 29.1 |
| 11.59375 | 33 |
| 11.6015625 | 31.4 |
| 11.609375 | 33.4 |
| 11.6171875 | 34.5 |
| 11.625 | 28.1 |
| 11.6328125 | 21.7 |
| 11.640625 | 19.9 |
| 11.6484375 | 16.7 |
| 11.65625 | 8.3 |
| 11.6640625 | -1 |
| 11.671875 | -6.7 |
| 11.6796875 | -12.3 |
| 11.6875 | -16.4 |
| 11.6953125 | -13.3 |
| 11.703125 | -9.9 |
| 11.7109375 | -12.9 |
| 11.71875 | -16.3 |
| 11.7265625 | -17.4 |
| 11.734375 | -17.6 |
| 11.7421875 | -14.1 |
| 11.75 | -9 |
| 11.7578125 | -8.4 |
| 11.765625 | -10.8 |
| 11.7734375 | -10.8 |
| 11.78125 | -10.4 |
| 11.7890625 | -13 |
| 11.796875 | -14.6 |
| 11.8046875 | -13.5 |
| 11.8125 | -14.8 |
| 11.8203125 | -19.3 |
| 11.828125 | -22.4 |
| 11.8359375 | -23.5 |
| 11.84375 | -26.6 |
| 11.8515625 | -30.8 |
| 11.859375 | -31.7 |
| 11.8671875 | -32.7 |
| 11.875 | -36.2 |
| 11.8828125 | -36.6 |
| 11.890625 | -33 |
| 11.8984375 | -27.7 |
| 11.90625 | -20.8 |
| 11.9140625 | -16.7 |
| 11.921875 | -16.5 |
| 11.9296875 | -14.9 |
| 11.9375 | -12.3 |
| 11.9453125 | -12.8 |
| 11.953125 | -13.8 |
| 11.9609375 | -10.9 |
| 11.96875 | -6.3 |
| 11.9765625 | -2.6 |
| 11.984375 | -0.4 |
| 11.9921875 | 1.5 |
| 12.0 | 6.7 |
| 12.0078125 | 12.7 |
| 12.015625 | 18.8 |
| 12.0234375 | 30.7 |
| 12.03125 | 38.7 |
| 12.0390625 | 37.1 |
| 12.046875 | 42.5 |
| 12.0546875 | 51.2 |
| 12.0625 | 49.4 |
| 12.0703125 | 45.6 |
| 12.078125 | 42.2 |
| 12.0859375 | 34.7 |
| 12.09375 | 28.7 |
| 12.1015625 | 24.3 |
| 12.109375 | 19.8 |
| 12.1171875 | 15.9 |
| 12.125 | 12 |
| 12.1328125 | 13.3 |
| 12.140625 | 16.9 |
| 12.1484375 | 13.8 |
| 12.15625 | 9.9 |
| 12.1640625 | 10.7 |
| 12.171875 | 11.2 |
| 12.1796875 | 13.6 |
| 12.1875 | 22.4 |
| 12.1953125 | 29.7 |
| 12.203125 | 29.1 |
| 12.2109375 | 27.4 |
| 12.21875 | 26.2 |
| 12.2265625 | 20.4 |
| 12.234375 | 14 |
| 12.2421875 | 11.4 |
| 12.25 | 7.9 |
| 12.2578125 | 4.3 |
| 12.265625 | 4.8 |
| 12.2734375 | 7.7 |
| 12.28125 | 10.6 |
| 12.2890625 | 14.1 |
| 12.296875 | 19.2 |
| 12.3046875 | 25.4 |
| 12.3125 | 30.9 |
| 12.3203125 | 34.3 |
| 12.328125 | 34.6 |
| 12.3359375 | 33.6 |
| 12.34375 | 33.3 |
| 12.3515625 | 30.4 |
| 12.359375 | 26.3 |
| 12.3671875 | 25.7 |
| 12.375 | 20.6 |
| 12.3828125 | 7.5 |
| 12.390625 | -2.7 |
| 12.3984375 | -8.3 |
| 12.40625 | -12.2 |
| 12.4140625 | -10.7 |
| 12.421875 | -9.4 |
| 12.4296875 | -14 |
| 12.4375 | -14.9 |
| 12.4453125 | -11 |
| 12.453125 | -11.6 |
| 12.4609375 | -9.8 |
| 12.46875 | 2.5 |
| 12.4765625 | 13.7 |
| 12.484375 | 14.9 |
| 12.4921875 | 10.7 |
| 12.5 | 7 |
| 12.5078125 | 6.5 |
| 12.515625 | 9 |
| 12.5234375 | 12.7 |
| 12.53125 | 11.7 |
| 12.5390625 | 3.3 |
| 12.546875 | -1.8 |
| 12.5546875 | -0.4 |
| 12.5625 | -1.6 |
| 12.5703125 | -3.9 |
| 12.578125 | -5.2 |
| 12.5859375 | -8.8 |
| 12.59375 | -10.6 |
| 12.6015625 | -11.3 |
| 12.609375 | -12.3 |
| 12.6171875 | -12.1 |
| 12.625 | -14.4 |
| 12.6328125 | -14.4 |
| 12.640625 | -12.1 |
| 12.6484375 | -16.6 |
| 12.65625 | -19.5 |
| 12.6640625 | -18.5 |
| 12.671875 | -19.6 |
| 12.6796875 | -13.5 |
| 12.6875 | -6.1 |
| 12.6953125 | -5.8 |
| 12.703125 | -4.7 |
| 12.7109375 | -8.7 |
| 12.71875 | -13.9 |
| 12.7265625 | -6.4 |
| 12.734375 | 0.4 |
| 12.7421875 | 2.1 |
| 12.75 | 5.6 |
| 12.7578125 | 3.2 |
| 12.765625 | 1.9 |
| 12.7734375 | 7.2 |
| 12.78125 | 6.3 |
| 12.7890625 | 1.9 |
| 12.796875 | -0.7 |
| 12.8046875 | -4.5 |
| 12.8125 | -3.9 |
| 12.8203125 | -1 |
| 12.828125 | -2.4 |
| 12.8359375 | -3.9 |
| 12.84375 | -4.1 |
| 12.8515625 | -5.3 |
| 12.859375 | -9.2 |
| 12.8671875 | -14.2 |
| 12.875 | -14.3 |
| 12.8828125 | -11.5 |
| 12.890625 | -9.6 |
| 12.8984375 | -5.6 |
| 12.90625 | -5.5 |
| 12.9140625 | -13.1 |
| 12.921875 | -17.2 |
| 12.9296875 | -14.3 |
| 12.9375 | -11.2 |
| 12.9453125 | -7.8 |
| 12.953125 | -4.1 |
| 12.9609375 | -2.4 |
| 12.96875 | -4.5 |
| 12.9765625 | -10.3 |
| 12.984375 | -13 |
| 12.9921875 | -9 |
| 13.0 | -5.3 |
| 13.0078125 | -1.7 |
| 13.015625 | 4.6 |
| 13.0234375 | 5.6 |
| 13.03125 | 2.9 |
| 13.0390625 | 4.5 |
| 13.046875 | 5 |
| 13.0546875 | 2 |
| 13.0625 | 0.7 |
| 13.0703125 | 1.4 |
| 13.078125 | 6.1 |
| 13.0859375 | 13.4 |
| 13.09375 | 14.7 |
| 13.1015625 | 12.3 |
| 13.109375 | 13.4 |
| 13.1171875 | 13.9 |
| 13.125 | 12.2 |
| 13.1328125 | 14.4 |
| 13.140625 | 18.7 |
| 13.1484375 | 20 |
| 13.15625 | 21.1 |
| 13.1640625 | 24.1 |
| 13.171875 | 24.1 |
| 13.1796875 | 20.3 |
| 13.1875 | 13.9 |
| 13.1953125 | 2.7 |
| 13.203125 | -7 |
| 13.2109375 | -11.1 |
| 13.21875 | -18.8 |
| 13.2265625 | -29.6 |
| 13.234375 | -34.1 |
| 13.2421875 | -29.5 |
| 13.25 | -20.3 |
| 13.2578125 | -20.1 |
| 13.265625 | -31.2 |
| 13.2734375 | -40 |
| 13.28125 | -45.9 |
| 13.2890625 | -50.7 |
| 13.296875 | -48.5 |
| 13.3046875 | -46.7 |
| 13.3125 | -48.8 |
| 13.3203125 | -48.5 |
| 13.328125 | -49.3 |
| 13.3359375 | -52.3 |
| 13.34375 | -54.5 |
| 13.3515625 | -53.2 |
| 13.359375 | -39.6 |
| 13.3671875 | -19.9 |
| 13.375 | -3.9 |
| 13.3828125 | 16.4 |
| 13.390625 | 33.6 |
| 13.3984375 | 31.5 |
| 13.40625 | 20.2 |
| 13.4140625 | 10.7 |
| 13.421875 | 5.8 |
| 13.4296875 | 11.4 |
| 13.4375 | 20.3 |
| 13.4453125 | 25.4 |
| 13.453125 | 32.4 |
| 13.4609375 | 34.6 |
| 13.46875 | 24.3 |
| 13.4765625 | 15.5 |
| 13.484375 | 13.3 |
| 13.4921875 | 8.3 |
| 13.5 | 6.6 |
| 13.5078125 | 12.4 |
| 13.515625 | 15.4 |
| 13.5234375 | 15.2 |
| 13.53125 | 16.1 |
| 13.5390625 | 13.2 |
| 13.546875 | 6.9 |
| 13.5546875 | 0.8 |
| 13.5625 | -4.5 |
| 13.5703125 | -6.8 |
| 13.578125 | -4.8 |
| 13.5859375 | 0.6 |
| 13.59375 | 7.8 |
| 13.6015625 | 13.3 |
| 13.609375 | 17.2 |
| 13.6171875 | 18.7 |
| 13.625 | 17.3 |
| 13.6328125 | 18 |
| 13.640625 | 18.6 |
| 13.6484375 | 15.3 |
| 13.65625 | 13.9 |
| 13.6640625 | 15.4 |
| 13.671875 | 18 |
| 13.6796875 | 25.1 |
| 13.6875 | 32.9 |
| 13.6953125 | 36.5 |
| 13.703125 | 36.5 |
| 13.7109375 | 30.4 |
| 13.71875 | 19.9 |
| 13.7265625 | 11.8 |
| 13.734375 | 8.7 |
| 13.7421875 | 5.5 |
| 13.75 | -1.3 |
| 13.7578125 | 0 |
| 13.765625 | 13.1 |
| 13.7734375 | 18.9 |
| 13.78125 | 13.9 |
| 13.7890625 | 9.2 |
| 13.796875 | 2.4 |
| 13.8046875 | -5.3 |
| 13.8125 | -8.7 |
| 13.8203125 | -11.5 |
| 13.828125 | -13.6 |
| 13.8359375 | -14.7 |
| 13.84375 | -16.3 |
| 13.8515625 | -13.6 |
| 13.859375 | -8 |
| 13.8671875 | -8.9 |
| 13.875 | -16.7 |
| 13.8828125 | -23.7 |
| 13.890625 | -27.9 |
| 13.8984375 | -28.3 |
| 13.90625 | -17.2 |
| 13.9140625 | 1.3 |
| 13.921875 | 14.6 |
| 13.9296875 | 23 |
| 13.9375 | 27.6 |
| 13.9453125 | 25.5 |
| 13.953125 | 19.8 |
| 13.9609375 | 9.7 |
| 13.96875 | -5.1 |
| 13.9765625 | -13.7 |
| 13.984375 | -14 |
| 13.9921875 | -14.9 |
| 14.0 | -16.8 |
| 14.0078125 | -15 |
| 14.015625 | -14.4 |
| 14.0234375 | -20.9 |
| 14.03125 | -29.4 |
| 14.0390625 | -35.7 |
| 14.046875 | -40.4 |
| 14.0546875 | -39.6 |
| 14.0625 | -36.4 |
| 14.0703125 | -36 |
| 14.078125 | -31.2 |
| 14.0859375 | -22.7 |
| 14.09375 | -16.2 |
| 14.1015625 | -6.3 |
| 14.109375 | 4.7 |
| 14.1171875 | 6.8 |
| 14.125 | -1.3 |
| 14.1328125 | -13.9 |
| 14.140625 | -22 |
| 14.1484375 | -23.1 |
| 14.15625 | -21.6 |
| 14.1640625 | -21.5 |
| 14.171875 | -29.2 |
| 14.1796875 | -41.7 |
| 14.1875 | -44.9 |
| 14.1953125 | -42.6 |
| 14.203125 | -44.9 |
| 14.2109375 | -42.9 |
| 14.21875 | -33.5 |
| 14.2265625 | -26 |
| 14.234375 | -19.2 |
| 14.2421875 | -11 |
| 14.25 | -5.1 |
| 14.2578125 | 2.5 |
| 14.265625 | 11.5 |
| 14.2734375 | 14.6 |
| 14.28125 | 17.2 |
| 14.2890625 | 20.2 |
| 14.296875 | 13.4 |
| 14.3046875 | 3.3 |
| 14.3125 | -2.1 |
| 14.3203125 | -10.6 |
| 14.328125 | -17 |
| 14.3359375 | -13.9 |
| 14.34375 | -10.8 |
| 14.3515625 | -7.7 |
| 14.359375 | -1.9 |
| 14.3671875 | -1.6 |
| 14.375 | -0.4 |
| 14.3828125 | 5.9 |
| 14.390625 | 2.9 |
| 14.3984375 | -3.9 |
| 14.40625 | -0.1 |
| 14.4140625 | 4.9 |
| 14.421875 | 4.5 |
| 14.4296875 | 6.8 |
| 14.4375 | 13.7 |
| 14.4453125 | 20.2 |
| 14.453125 | 18.1 |
| 14.4609375 | 9.9 |
| 14.46875 | 11 |
| 14.4765625 | 18.5 |
| 14.484375 | 19.8 |
| 14.4921875 | 18.3 |
| 14.5 | 15.6 |
| 14.5078125 | 11.6 |
| 14.515625 | 9.9 |
| 14.5234375 | 6.1 |
| 14.53125 | 2 |
| 14.5390625 | 4.1 |
| 14.546875 | 5.9 |
| 14.5546875 | 4.3 |
| 14.5625 | 3.2 |
| 14.5703125 | 2.3 |
| 14.578125 | 3.2 |
| 14.5859375 | 2.9 |
| 14.59375 | -2.4 |
| 14.6015625 | -5.7 |
| 14.609375 | -6.2 |
| 14.6171875 | -8 |
| 14.625 | -8.5 |
| 14.6328125 | -8.1 |
| 14.640625 | -7.5 |
| 14.6484375 | -8 |
| 14.65625 | -10.9 |
| 14.6640625 | -7.5 |
| 14.671875 | -0.9 |
| 14.6796875 | -4.4 |
| 14.6875 | -9.3 |
| 14.6953125 | -5.7 |
| 14.703125 | -1 |
| 14.7109375 | 3.5 |
| 14.71875 | 6.1 |
| 14.7265625 | 3.7 |
| 14.734375 | 5.5 |
| 14.7421875 | 10.8 |
| 14.75 | 9.4 |
| 14.7578125 | 8.2 |
| 14.765625 | 12.2 |
| 14.7734375 | 14 |
| 14.78125 | 16 |
| 14.7890625 | 19.2 |
| 14.796875 | 16.4 |
| 14.8046875 | 14.5 |
| 14.8125 | 18.7 |
| 14.8203125 | 19.6 |
| 14.828125 | 18.8 |
| 14.8359375 | 22.5 |
| 14.84375 | 24.9 |
| 14.8515625 | 24.4 |
| 14.859375 | 23.7 |
| 14.8671875 | 20.6 |
| 14.875 | 16.9 |
| 14.8828125 | 14.5 |
| 14.890625 | 11.5 |
| 14.8984375 | 8.7 |
| 14.90625 | 8.7 |
| 14.9140625 | 14.4 |
| 14.921875 | 21.9 |
| 14.9296875 | 24.6 |
| 14.9375 | 26.5 |
| 14.9453125 | 30.5 |
| 14.953125 | 31.5 |
| 14.9609375 | 31.8 |
| 14.96875 | 33.1 |
| 14.9765625 | 31.6 |
| 14.984375 | 32 |
| 14.9921875 | 35.2 |
| 15.0 | 34.4 |
| 15.0078125 | 34.5 |
| 15.015625 | 39.1 |
| 15.0234375 | 40.3 |
| 15.03125 | 39.6 |
| 15.0390625 | 42.2 |
| 15.046875 | 44.7 |
| 15.0546875 | 46.7 |
| 15.0625 | 48 |
| 15.0703125 | 47.4 |
| 15.078125 | 48.5 |
| 15.0859375 | 50.1 |
| 15.09375 | 49.7 |
| 15.1015625 | 51.2 |
| 15.109375 | 52.5 |
| 15.1171875 | 51.8 |
| 15.125 | 53.6 |
| 15.1328125 | 53.1 |
| 15.140625 | 46.1 |
| 15.1484375 | 36.9 |
| 15.15625 | 26.8 |
| 15.1640625 | 16.1 |
| 15.171875 | 7.6 |
| 15.1796875 | 0.2 |
| 15.1875 | -7.1 |
| 15.1953125 | -13.5 |
| 15.203125 | -19.2 |
| 15.2109375 | -25 |
| 15.21875 | -29.5 |
| 15.2265625 | -31.3 |
| 15.234375 | -29.8 |
| 15.2421875 | -21.4 |
| 15.25 | -10 |
| 15.2578125 | -5.5 |
| 15.265625 | -5.8 |
| 15.2734375 | -7.1 |
| 15.28125 | -11.1 |
| 15.2890625 | -11.5 |
| 15.296875 | -5 |
| 15.3046875 | -1.4 |
| 15.3125 | -6 |
| 15.3203125 | -13.4 |
| 15.328125 | -15.5 |
| 15.3359375 | -14.3 |
| 15.34375 | -19.3 |
| 15.3515625 | -24.2 |
| 15.359375 | -21 |
| 15.3671875 | -18.9 |
| 15.375 | -21.7 |
| 15.3828125 | -22.6 |
| 15.390625 | -19 |
| 15.3984375 | -16.7 |
| 15.40625 | -22.1 |
| 15.4140625 | -27.7 |
| 15.421875 | -27.2 |
| 15.4296875 | -29.3 |
| 15.4375 | -31.5 |
| 15.4453125 | -26.7 |
| 15.453125 | -24.6 |
| 15.4609375 | -28.1 |
| 15.46875 | -31.5 |
| 15.4765625 | -36 |
| 15.484375 | -37.9 |
| 15.4921875 | -34.7 |
| 15.5 | -34 |
| 15.5078125 | -35.4 |
| 15.515625 | -32.7 |
| 15.5234375 | -29.8 |
| 15.53125 | -31.5 |
| 15.5390625 | -31.6 |
| 15.546875 | -28.3 |
| 15.5546875 | -30.1 |
| 15.5625 | -32.6 |
| 15.5703125 | -27.6 |
| 15.578125 | -25.2 |
| 15.5859375 | -31.5 |
| 15.59375 | -38.1 |
| 15.6015625 | -41.7 |
| 15.609375 | -42.3 |
| 15.6171875 | -41.2 |
| 15.625 | -42.8 |
| 15.6328125 | -42.7 |
| 15.640625 | -36.1 |
| 15.6484375 | -30 |
| 15.65625 | -25.9 |
| 15.6640625 | -16.6 |
| 15.671875 | -5.7 |
| 15.6796875 | -1.6 |
| 15.6875 | -4 |
| 15.6953125 | -9.2 |
| 15.703125 | -14.9 |
| 15.7109375 | -18 |
| 15.71875 | -19 |
| 15.7265625 | -20.2 |
| 15.734375 | -22.7 |
| 15.7421875 | -25.5 |
| 15.75 | -24.9 |
| 15.7578125 | -22.3 |
| 15.765625 | -20.7 |
| 15.7734375 | -16.2 |
| 15.78125 | -11.5 |
| 15.7890625 | -9.4 |
| 15.796875 | -1.9 |
| 15.8046875 | 6.2 |
| 15.8125 | 7.8 |
| 15.8203125 | 11.6 |
| 15.828125 | 16 |
| 15.8359375 | 14.9 |
| 15.84375 | 13.3 |
| 15.8515625 | 11.3 |
| 15.859375 | 10.7 |
| 15.8671875 | 13.8 |
| 15.875 | 14.2 |
| 15.8828125 | 16 |
| 15.890625 | 18.3 |
| 15.8984375 | 10.5 |
| 15.90625 | 3.5 |
| 15.9140625 | 2.1 |
| 15.921875 | -3.3 |
| 15.9296875 | -3.3 |
| 15.9375 | 4 |
| 15.9453125 | 7.9 |
| 15.953125 | 13.6 |
| 15.9609375 | 21 |
| 15.96875 | 24.1 |
| 15.9765625 | 27.6 |
| 15.984375 | 29.3 |
| 15.9921875 | 27.7 |
| 16.0 | 31.5 |
| 16.0078125 | 35.3 |
| 16.015625 | 30.8 |
| 16.0234375 | 25.8 |
| 16.03125 | 25.1 |
| 16.0390625 | 22.5 |
| 16.046875 | 18.2 |
| 16.0546875 | 18.6 |
| 16.0625 | 23.5 |
| 16.0703125 | 27.3 |
| 16.078125 | 24.6 |
| 16.0859375 | 17.7 |
| 16.09375 | 15.2 |
| 16.1015625 | 14.9 |
| 16.109375 | 11.2 |
| 16.1171875 | 9.9 |
| 16.125 | 10.1 |
| 16.1328125 | 9.1 |
| 16.140625 | 13 |
| 16.1484375 | 17.9 |
| 16.15625 | 18.3 |
| 16.1640625 | 19.3 |
| 16.171875 | 19.7 |
| 16.1796875 | 17.3 |
| 16.1875 | 16.5 |
| 16.1953125 | 16.7 |
| 16.203125 | 14.9 |
| 16.2109375 | 8.7 |
| 16.21875 | -1.1 |
| 16.2265625 | -8.5 |
| 16.234375 | -12 |
| 16.2421875 | -14.6 |
| 16.25 | -19.6 |
| 16.2578125 | -26.9 |
| 16.265625 | -29.2 |
| 16.2734375 | -27.6 |
| 16.28125 | -29.6 |
| 16.2890625 | -31.8 |
| 16.296875 | -31.4 |
| 16.3046875 | -32.4 |
| 16.3125 | -32.1 |
| 16.3203125 | -29.7 |
| 16.328125 | -33 |
| 16.3359375 | -39.9 |
| 16.34375 | -38.7 |
| 16.3515625 | -32 |
| 16.359375 | -26.7 |
| 16.3671875 | -21.2 |
| 16.375 | -16.5 |
| 16.3828125 | -11 |
| 16.390625 | -1.9 |
| 16.3984375 | 3.8 |
| 16.40625 | 8 |
| 16.4140625 | 12.8 |
| 16.421875 | 9.7 |
| 16.4296875 | 6.2 |
| 16.4375 | 7.8 |
| 16.4453125 | 1.7 |
| 16.453125 | -8.7 |
| 16.4609375 | -16.4 |
| 16.46875 | -26.7 |
| 16.4765625 | -33.6 |
| 16.484375 | -30.8 |
| 16.4921875 | -27.1 |
| 16.5 | -25.7 |
| 16.5078125 | -22.2 |
| 16.515625 | -17.4 |
| 16.5234375 | -10 |
| 16.53125 | 4.7 |
| 16.5390625 | 21.3 |
| 16.546875 | 30 |
| 16.5546875 | 33.5 |
| 16.5625 | 38.9 |
| 16.5703125 | 47.4 |
| 16.578125 | 57 |
| 16.5859375 | 62.2 |
| 16.59375 | 62 |
| 16.6015625 | 61.7 |
| 16.609375 | 62.5 |
| 16.6171875 | 62.1 |
| 16.625 | 61.5 |
| 16.6328125 | 62.1 |
| 16.640625 | 64 |
| 16.6484375 | 67.9 |
| 16.65625 | 70.9 |
| 16.6640625 | 66.6 |
| 16.671875 | 57.2 |
| 16.6796875 | 50.3 |
| 16.6875 | 44.4 |
| 16.6953125 | 38.9 |
| 16.703125 | 36 |
| 16.7109375 | 30 |
| 16.71875 | 21.4 |
| 16.7265625 | 18.8 |
| 16.734375 | 18.6 |
| 16.7421875 | 17.7 |
| 16.75 | 21.8 |
| 16.7578125 | 24.9 |
| 16.765625 | 20.8 |
| 16.7734375 | 16.5 |
| 16.78125 | 10.1 |
| 16.7890625 | -3.7 |
| 16.796875 | -16.8 |
| 16.8046875 | -23.1 |
| 16.8125 | -20.7 |
| 16.8203125 | -11.1 |
| 16.828125 | -3.6 |
| 16.8359375 | 0.7 |
| 16.84375 | 5.1 |
| 16.8515625 | 6 |
| 16.859375 | 5.3 |
| 16.8671875 | 5.5 |
| 16.875 | 4.3 |
| 16.8828125 | 1.6 |
| 16.890625 | -4.1 |
| 16.8984375 | -12.6 |
| 16.90625 | -17.3 |
| 16.9140625 | -16.4 |
| 16.921875 | -16.5 |
| 16.9296875 | -23.3 |
| 16.9375 | -26.7 |
| 16.9453125 | -18.3 |
| 16.953125 | -13 |
| 16.9609375 | -16.4 |
| 16.96875 | -16.2 |
| 16.9765625 | -12.5 |
| 16.984375 | -8 |
| 16.9921875 | -4.6 |
| 17.0 | -9.6 |
| 17.0078125 | -15.4 |
| 17.015625 | -14.8 |
| 17.0234375 | -15.2 |
| 17.03125 | -14.7 |
| 17.0390625 | -12.6 |
| 17.046875 | -14.4 |
| 17.0546875 | -15.8 |
| 17.0625 | -19.2 |
| 17.0703125 | -26.8 |
| 17.078125 | -26.5 |
| 17.0859375 | -23.3 |
| 17.09375 | -30.4 |
| 17.1015625 | -39.1 |
| 17.109375 | -39.8 |
| 17.1171875 | -35.3 |
| 17.125 | -32.6 |
| 17.1328125 | -36.9 |
| 17.140625 | -39.3 |
| 17.1484375 | -34.6 |
| 17.15625 | -36.1 |
| 17.1640625 | -44.1 |
| 17.171875 | -45.8 |
| 17.1796875 | -44.3 |
| 17.1875 | -44.8 |
| 17.1953125 | -45.2 |
| 17.203125 | -45 |
| 17.2109375 | -42.8 |
| 17.21875 | -36 |
| 17.2265625 | -28.5 |
| 17.234375 | -25.5 |
| 17.2421875 | -24.4 |
| 17.25 | -23.4 |
| 17.2578125 | -24.5 |
| 17.265625 | -27.1 |
| 17.2734375 | -29.2 |
| 17.28125 | -28.5 |
| 17.2890625 | -24 |
| 17.296875 | -22.4 |
| 17.3046875 | -23.2 |
| 17.3125 | -17.3 |
| 17.3203125 | -10.2 |
| 17.328125 | -6.4 |
| 17.3359375 | 3.8 |
| 17.34375 | 16.9 |
| 17.3515625 | 24.6 |
| 17.359375 | 29.9 |
| 17.3671875 | 31.4 |
| 17.375 | 28.7 |
| 17.3828125 | 24 |
| 17.390625 | 15.8 |
| 17.3984375 | 10.7 |
| 17.40625 | 8 |
| 17.4140625 | -3.2 |
| 17.421875 | -15.2 |
| 17.4296875 | -20.8 |
| 17.4375 | -26.1 |
| 17.4453125 | -29.8 |
| 17.453125 | -33 |
| 17.4609375 | -38.1 |
| 17.46875 | -38.1 |
| 17.4765625 | -34.6 |
| 17.484375 | -31.9 |
| 17.4921875 | -25.8 |
| 17.5 | -17.5 |
| 17.5078125 | -11.9 |
| 17.515625 | -9.3 |
| 17.5234375 | -5.4 |
| 17.53125 | 2.6 |
| 17.5390625 | 7.1 |
| 17.546875 | 4.4 |
| 17.5546875 | 2.1 |
| 17.5625 | 1.3 |
| 17.5703125 | 2.4 |
| 17.578125 | 9.7 |
| 17.5859375 | 17 |
| 17.59375 | 19.8 |
| 17.6015625 | 22.6 |
| 17.609375 | 25.9 |
| 17.6171875 | 26.6 |
| 17.625 | 23.6 |
| 17.6328125 | 21.1 |
| 17.640625 | 21.2 |
| 17.6484375 | 15.2 |
| 17.65625 | 5.6 |
| 17.6640625 | 2.9 |
| 17.671875 | 1.7 |
| 17.6796875 | 0.7 |
| 17.6875 | 3.5 |
| 17.6953125 | 1.5 |
| 17.703125 | -2.6 |
| 17.7109375 | -4.8 |
| 17.71875 | -14.4 |
| 17.7265625 | -23.3 |
| 17.734375 | -21.5 |
| 17.7421875 | -19.2 |
| 17.75 | -17.4 |
| 17.7578125 | -10.1 |
| 17.765625 | -3.6 |
| 17.7734375 | 1.5 |
| 17.78125 | 7.9 |
| 17.7890625 | 9 |
| 17.796875 | 6.4 |
| 17.8046875 | 9.6 |
| 17.8125 | 15 |
| 17.8203125 | 17.7 |
| 17.828125 | 27.6 |
| 17.8359375 | 44.2 |
| 17.84375 | 54.4 |
| 17.8515625 | 58.5 |
| 17.859375 | 60.1 |
| 17.8671875 | 56.4 |
| 17.875 | 50.1 |
| 17.8828125 | 43.9 |
| 17.890625 | 37.1 |
| 17.8984375 | 30.3 |
| 17.90625 | 22.5 |
| 17.9140625 | 16.8 |
| 17.921875 | 13.5 |
| 17.9296875 | 8 |
| 17.9375 | 5.9 |
| 17.9453125 | 7.9 |
| 17.953125 | 5.4 |
| 17.9609375 | 5.2 |
| 17.96875 | 9.2 |
| 17.9765625 | 5.3 |
| 17.984375 | -1.1 |
| 17.9921875 | -0.1 |
| 18.0 | 4.2 |
| 18.0078125 | 7.9 |
| 18.015625 | 7.9 |
| 18.0234375 | 5.7 |
| 18.03125 | 7.2 |
| 18.0390625 | 8.6 |
| 18.046875 | 7.2 |
| 18.0546875 | 7.3 |
| 18.0625 | 5.9 |
| 18.0703125 | 3.6 |
| 18.078125 | 7.1 |
| 18.0859375 | 10.9 |
| 18.09375 | 6.9 |
| 18.1015625 | 1.3 |
| 18.109375 | 3.1 |
| 18.1171875 | 7.9 |
| 18.125 | 10 |
| 18.1328125 | 12 |
| 18.140625 | 14 |
| 18.1484375 | 12.8 |
| 18.15625 | 9.2 |
| 18.1640625 | 8.8 |
| 18.171875 | 9.1 |
| 18.1796875 | -0.2 |
| 18.1875 | -12.2 |
| 18.1953125 | -13.3 |
| 18.203125 | -13.5 |
| 18.2109375 | -20.1 |
| 18.21875 | -23.1 |
| 18.2265625 | -21.2 |
| 18.234375 | -20.5 |
| 18.2421875 | -23.3 |
| 18.25 | -25.2 |
| 18.2578125 | -19 |
| 18.265625 | -11.4 |
| 18.2734375 | -7.3 |
| 18.28125 | 1.2 |
| 18.2890625 | 12.4 |
| 18.296875 | 18.4 |
| 18.3046875 | 17.6 |
| 18.3125 | 14.6 |
| 18.3203125 | 16.6 |
| 18.328125 | 18.3 |
| 18.3359375 | 14.7 |
| 18.34375 | 13 |
| 18.3515625 | 11.2 |
| 18.359375 | 8.3 |
| 18.3671875 | 8.1 |
| 18.375 | 3.6 |
| 18.3828125 | -2.9 |
| 18.390625 | -4.7 |
| 18.3984375 | -10.8 |
| 18.40625 | -19.3 |
| 18.4140625 | -19 |
| 18.421875 | -12.6 |
| 18.4296875 | -4.5 |
| 18.4375 | 4.4 |
| 18.4453125 | 10.4 |
| 18.453125 | 10.6 |
| 18.4609375 | 6 |
| 18.46875 | 3.3 |
| 18.4765625 | 2.2 |
| 18.484375 | -6 |
| 18.4921875 | -13.3 |
| 18.5 | -9.3 |
| 18.5078125 | -6.8 |
| 18.515625 | -12.5 |
| 18.5234375 | -16.4 |
| 18.53125 | -17.7 |
| 18.5390625 | -20.3 |
| 18.546875 | -24.8 |
| 18.5546875 | -27.4 |
| 18.5625 | -20.7 |
| 18.5703125 | -9.9 |
| 18.578125 | -2.2 |
| 18.5859375 | 8.4 |
| 18.59375 | 16.5 |
| 18.6015625 | 15.3 |
| 18.609375 | 13.8 |
| 18.6171875 | 12.2 |
| 18.625 | 9.1 |
| 18.6328125 | 10.5 |
| 18.640625 | 11.1 |
| 18.6484375 | 13.2 |
| 18.65625 | 23 |
| 18.6640625 | 24.6 |
| 18.671875 | 19.5 |
| 18.6796875 | 28.5 |
| 18.6875 | 38.1 |
| 18.6953125 | 34.5 |
| 18.703125 | 33.4 |
| 18.7109375 | 35.6 |
| 18.71875 | 34.7 |
| 18.7265625 | 39.1 |
| 18.734375 | 48.7 |
| 18.7421875 | 54.1 |
| 18.75 | 51.7 |
| 18.7578125 | 45.7 |
| 18.765625 | 42.3 |
| 18.7734375 | 38.6 |
| 18.78125 | 33.7 |
| 18.7890625 | 32.8 |
| 18.796875 | 31.2 |
| 18.8046875 | 25.7 |
| 18.8125 | 18.8 |
| 18.8203125 | 9.8 |
| 18.828125 | 0.7 |
| 18.8359375 | -8.9 |
| 18.84375 | -19.8 |
| 18.8515625 | -27.2 |
| 18.859375 | -30.2 |
| 18.8671875 | -30.2 |
| 18.875 | -29.5 |
| 18.8828125 | -30.1 |
| 18.890625 | -28.3 |
| 18.8984375 | -30.2 |
| 18.90625 | -41.8 |
| 18.9140625 | -48.5 |
| 18.921875 | -45.7 |
| 18.9296875 | -42.2 |
| 18.9375 | -36 |
| 18.9453125 | -30.9 |
| 18.953125 | -27.9 |
| 18.9609375 | -13.3 |
| 18.96875 | 12.1 |
| 18.9765625 | 36.1 |
| 18.984375 | 57.3 |
| 18.9921875 | 75.7 |
| 19.0 | 89 |
| 19.0078125 | 98.2 |
| 19.015625 | 100.1 |
| 19.0234375 | 89.6 |
| 19.03125 | 75.8 |
| 19.0390625 | 73.3 |
| 19.046875 | 77.3 |
| 19.0546875 | 72.4 |
| 19.0625 | 58.8 |
| 19.0703125 | 41.6 |
| 19.078125 | 19.3 |
| 19.0859375 | -2.7 |
| 19.09375 | -18.6 |
| 19.1015625 | -34.9 |
| 19.109375 | -52.7 |
| 19.1171875 | -61.4 |
| 19.125 | -57.6 |
| 19.1328125 | -46.9 |
| 19.140625 | -29.3 |
| 19.1484375 | -0.4 |
| 19.15625 | 34.5 |
| 19.1640625 | 64.4 |
| 19.171875 | 90.5 |
| 19.1796875 | 116.2 |
| 19.1875 | 133.1 |
| 19.1953125 | 137.4 |
| 19.203125 | 134.3 |
| 19.2109375 | 126.7 |
| 19.21875 | 114.2 |
| 19.2265625 | 93.7 |
| 19.234375 | 64.6 |
| 19.2421875 | 35.8 |
| 19.25 | 12.5 |
| 19.2578125 | -9.9 |
| 19.265625 | -33.7 |
| 19.2734375 | -57.4 |
| 19.28125 | -82.3 |
| 19.2890625 | -109.9 |
| 19.296875 | -136.3 |
| 19.3046875 | -154.9 |
| 19.3125 | -164.6 |
| 19.3203125 | -169.6 |
| 19.328125 | -173.3 |
| 19.3359375 | -181.2 |
| 19.34375 | -198.7 |
| 19.3515625 | -219.4 |
| 19.359375 | -232.9 |
| 19.3671875 | -234.7 |
| 19.375 | -223 |
| 19.3828125 | -206.3 |
| 19.390625 | -198.5 |
| 19.3984375 | -201.9 |
| 19.40625 | -211.6 |
| 19.4140625 | -217.3 |
| 19.421875 | -207.3 |
| 19.4296875 | -185.4 |
| 19.4375 | -159.7 |
| 19.4453125 | -135.3 |
| 19.453125 | -120.9 |
| 19.4609375 | -116.4 |
| 19.46875 | -118.6 |
| 19.4765625 | -127.1 |
| 19.484375 | -128.7 |
| 19.4921875 | -112.5 |
| 19.5 | -87.5 |
| 19.5078125 | -63.5 |
| 19.515625 | -46.4 |
| 19.5234375 | -43.9 |
| 19.53125 | -55.2 |
| 19.5390625 | -71.2 |
| 19.546875 | -83.1 |
| 19.5546875 | -84.3 |
| 19.5625 | -72.9 |
| 19.5703125 | -50.9 |
| 19.578125 | -23.8 |
| 19.5859375 | -3.3 |
| 19.59375 | 0.7 |
| 19.6015625 | -5.5 |
| 19.609375 | -7.6 |
| 19.6171875 | -3.2 |
| 19.625 | 2.5 |
| 19.6328125 | 7.5 |
| 19.640625 | 11.7 |
| 19.6484375 | 18.4 |
| 19.65625 | 31.9 |
| 19.6640625 | 45.1 |
| 19.671875 | 48 |
| 19.6796875 | 46.2 |
| 19.6875 | 49.6 |
| 19.6953125 | 54.5 |
| 19.703125 | 57 |
| 19.7109375 | 59.1 |
| 19.71875 | 62 |
| 19.7265625 | 70.6 |
| 19.734375 | 87.1 |
| 19.7421875 | 106.1 |
| 19.75 | 124.2 |
| 19.7578125 | 135.6 |
| 19.765625 | 134.2 |
| 19.7734375 | 126.9 |
| 19.78125 | 122.6 |
| 19.7890625 | 122.1 |
| 19.796875 | 125.1 |
| 19.8046875 | 130.5 |
| 19.8125 | 136.7 |
| 19.8203125 | 142.9 |
| 19.828125 | 147.7 |
| 19.8359375 | 149 |
| 19.84375 | 146.6 |
| 19.8515625 | 143.6 |
| 19.859375 | 139.2 |
| 19.8671875 | 129.9 |
| 19.875 | 121.5 |
| 19.8828125 | 116.6 |
| 19.890625 | 108.5 |
| 19.8984375 | 99 |
| 19.90625 | 90.3 |
| 19.9140625 | 80 |
| 19.921875 | 71.4 |
| 19.9296875 | 63.3 |
| 19.9375 | 54.7 |
| 19.9453125 | 53.8 |
| 19.953125 | 56.8 |
| 19.9609375 | 53.5 |
| 19.96875 | 48.4 |
| 19.9765625 | 43.3 |
| 19.984375 | 35.8 |
| 19.9921875 | 32.2 |
| 20.0 | 35.8 |
| 20.0078125 | 39.4 |
| 20.015625 | 37.2 |
| 20.0234375 | 32.5 |
| 20.03125 | 30.8 |
| 20.0390625 | 29.2 |
| 20.046875 | 25.9 |
| 20.0546875 | 23.1 |
| 20.0625 | 19.8 |
| 20.0703125 | 19.1 |
| 20.078125 | 22.8 |
| 20.0859375 | 22.8 |
| 20.09375 | 18.4 |
| 20.1015625 | 13.4 |
| 20.109375 | 8.2 |
| 20.1171875 | 6.6 |
| 20.125 | 5.8 |
| 20.1328125 | -0.2 |
| 20.140625 | -4.1 |
| 20.1484375 | -5.3 |
| 20.15625 | -10.4 |
| 20.1640625 | -12.8 |
| 20.171875 | -11.5 |
| 20.1796875 | -12.8 |
| 20.1875 | -9.2 |
| 20.1953125 | 1.5 |
| 20.203125 | 8.7 |
| 20.2109375 | 12.4 |
| 20.21875 | 13 |
| 20.2265625 | 8.6 |
| 20.234375 | 7 |
| 20.2421875 | 10 |
| 20.25 | 14.6 |
| 20.2578125 | 22.7 |
| 20.265625 | 28.8 |
| 20.2734375 | 32.3 |
| 20.28125 | 38.5 |
| 20.2890625 | 42.5 |
| 20.296875 | 46.3 |
| 20.3046875 | 55.2 |
| 20.3125 | 61.4 |
| 20.3203125 | 65.2 |
| 20.328125 | 71.7 |
| 20.3359375 | 77.2 |
| 20.34375 | 83.6 |
| 20.3515625 | 92.1 |
| 20.359375 | 98 |
| 20.3671875 | 101 |
| 20.375 | 103.2 |
| 20.3828125 | 108.4 |
| 20.390625 | 113.2 |
| 20.3984375 | 105.4 |
| 20.40625 | 89.5 |
| 20.4140625 | 78.7 |
| 20.421875 | 72.5 |
| 20.4296875 | 67.9 |
| 20.4375 | 63.5 |
| 20.4453125 | 53.9 |
| 20.453125 | 43.1 |
| 20.4609375 | 36.7 |
| 20.46875 | 28.6 |
| 20.4765625 | 18.6 |
| 20.484375 | 13.6 |
| 20.4921875 | 10.4 |
| 20.5 | 4 |
| 20.5078125 | -4.5 |
| 20.515625 | -15.7 |
| 20.5234375 | -27.2 |
| 20.53125 | -35.1 |
| 20.5390625 | -41.7 |
| 20.546875 | -48.9 |
| 20.5546875 | -56.6 |
| 20.5625 | -62.8 |
| 20.5703125 | -66.8 |
| 20.578125 | -73.6 |
| 20.5859375 | -81.5 |
| 20.59375 | -86.6 |
| 20.6015625 | -96.6 |
| 20.609375 | -109.5 |
| 20.6171875 | -116.7 |
| 20.625 | -123.8 |
| 20.6328125 | -131.1 |
| 20.640625 | -133.4 |
| 20.6484375 | -138.8 |
| 20.65625 | -148.5 |
| 20.6640625 | -155.2 |
| 20.671875 | -159.2 |
| 20.6796875 | -163.6 |
| 20.6875 | -169.5 |
| 20.6953125 | -170.7 |
| 20.703125 | -161.3 |
| 20.7109375 | -152.6 |
| 20.71875 | -152.3 |
| 20.7265625 | -151.6 |
| 20.734375 | -147.1 |
| 20.7421875 | -138.3 |
| 20.75 | -125.5 |
| 20.7578125 | -114.7 |
| 20.765625 | -104.4 |
| 20.7734375 | -92 |
| 20.78125 | -81.6 |
| 20.7890625 | -71.3 |
| 20.796875 | -59.8 |
| 20.8046875 | -49.9 |
| 20.8125 | -41.5 |
| 20.8203125 | -39 |
| 20.828125 | -43.6 |
| 20.8359375 | -47.1 |
| 20.84375 | -45.8 |
| 20.8515625 | -40.7 |
| 20.859375 | -33.7 |
| 20.8671875 | -27.1 |
| 20.875 | -17.2 |
| 20.8828125 | -6.6 |
| 20.890625 | -1.1 |
| 20.8984375 | 5.2 |
| 20.90625 | 12.4 |
| 20.9140625 | 15.1 |
| 20.921875 | 19.7 |
| 20.9296875 | 23.6 |
| 20.9375 | 20.4 |
| 20.9453125 | 19.1 |
| 20.953125 | 18.1 |
| 20.9609375 | 12 |
| 20.96875 | 8.9 |
| 20.9765625 | 5.2 |
| 20.984375 | 2.4 |
| 20.9921875 | 11.7 |
| 21.0 | 17 |
| 21.0078125 | 9.6 |
| 21.015625 | 8.9 |
| 21.0234375 | 14.4 |
| 21.03125 | 16.9 |
| 21.0390625 | 20.9 |
| 21.046875 | 22.4 |
| 21.0546875 | 20 |
| 21.0625 | 19.9 |
| 21.0703125 | 18.9 |
| 21.078125 | 14.2 |
| 21.0859375 | 12.7 |
| 21.09375 | 19 |
| 21.1015625 | 26.4 |
| 21.109375 | 29.3 |
| 21.1171875 | 33.4 |
| 21.125 | 39.9 |
| 21.1328125 | 40 |
| 21.140625 | 36.1 |
| 21.1484375 | 35.5 |
| 21.15625 | 35.5 |
| 21.1640625 | 33.5 |
| 21.171875 | 34.4 |
| 21.1796875 | 39.7 |
| 21.1875 | 44.7 |
| 21.1953125 | 46.8 |
| 21.203125 | 46.1 |
| 21.2109375 | 41.2 |
| 21.21875 | 36.1 |
| 21.2265625 | 36.2 |
| 21.234375 | 35.5 |
| 21.2421875 | 31.6 |
| 21.25 | 30.4 |
| 21.2578125 | 30.7 |
| 21.265625 | 28.1 |
| 21.2734375 | 24.7 |
| 21.28125 | 20.8 |
| 21.2890625 | 15.3 |
| 21.296875 | 14.1 |
| 21.3046875 | 21.7 |
| 21.3125 | 31.3 |
| 21.3203125 | 34.2 |
| 21.328125 | 30.7 |
| 21.3359375 | 26.4 |
| 21.34375 | 23 |
| 21.3515625 | 19 |
| 21.359375 | 16.4 |
| 21.3671875 | 18.1 |
| 21.375 | 20.3 |
| 21.3828125 | 21 |
| 21.390625 | 21.8 |
| 21.3984375 | 19.7 |
| 21.40625 | 14.9 |
| 21.4140625 | 17.3 |
| 21.421875 | 27.6 |
| 21.4296875 | 35.4 |
| 21.4375 | 42.8 |
| 21.4453125 | 53.8 |
| 21.453125 | 57.5 |
| 21.4609375 | 54.6 |
| 21.46875 | 56.6 |
| 21.4765625 | 56.7 |
| 21.484375 | 49.7 |
| 21.4921875 | 42.7 |
| 21.5 | 33.4 |
| 21.5078125 | 23.3 |
| 21.515625 | 17.9 |
| 21.5234375 | 9.3 |
| 21.53125 | -2.4 |
| 21.5390625 | -8.9 |
| 21.546875 | -14.2 |
| 21.5546875 | -18.2 |
| 21.5625 | -19.1 |
| 21.5703125 | -22.8 |
| 21.578125 | -24.1 |
| 21.5859375 | -19.7 |
| 21.59375 | -18.7 |
| 21.6015625 | -18.1 |
| 21.609375 | -12.4 |
| 21.6171875 | -8.6 |
| 21.625 | -10.1 |
| 21.6328125 | -14.9 |
| 21.640625 | -15.6 |
| 21.6484375 | -9.2 |
| 21.65625 | -8.9 |
| 21.6640625 | -15.1 |
| 21.671875 | -16.3 |
| 21.6796875 | -21.3 |
| 21.6875 | -32.1 |
| 21.6953125 | -36.5 |
| 21.703125 | -39.1 |
| 21.7109375 | -43.4 |
| 21.71875 | -42.6 |
| 21.7265625 | -40.6 |
| 21.734375 | -40 |
| 21.7421875 | -39.7 |
| 21.75 | -41.3 |
| 21.7578125 | -39.6 |
| 21.765625 | -35.6 |
| 21.7734375 | -37.5 |
| 21.78125 | -40.3 |
| 21.7890625 | -37.9 |
| 21.796875 | -33.3 |
| 21.8046875 | -27.1 |
| 21.8125 | -20.7 |
| 21.8203125 | -17.6 |
| 21.828125 | -15.1 |
| 21.8359375 | -8.2 |
| 21.84375 | -0.6 |
| 21.8515625 | 0.4 |
| 21.859375 | 0.7 |
| 21.8671875 | 5.7 |
| 21.875 | 5.1 |
| 21.8828125 | -0.6 |
| 21.890625 | -0.1 |
| 21.8984375 | 2.8 |
| 21.90625 | 5 |
| 21.9140625 | 8.1 |
| 21.921875 | 6.1 |
| 21.9296875 | 2.8 |
| 21.9375 | 3.2 |
| 21.9453125 | 1 |
| 21.953125 | 0.9 |
| 21.9609375 | 4.2 |
| 21.96875 | 3.2 |
| 21.9765625 | 5.3 |
| 21.984375 | 9.1 |
| 21.9921875 | 5.7 |
| 22.0 | 5.8 |
| 22.0078125 | 10.3 |
| 22.015625 | 7.8 |
| 22.0234375 | 4.2 |
| 22.03125 | 4.1 |
| 22.0390625 | 2.5 |
| 22.046875 | -0.5 |
| 22.0546875 | -2.3 |
| 22.0625 | 0.9 |
| 22.0703125 | 4.2 |
| 22.078125 | -2.3 |
| 22.0859375 | -9.9 |
| 22.09375 | -7.2 |
| 22.1015625 | -2.6 |
| 22.109375 | -3.9 |
| 22.1171875 | -7.5 |
| 22.125 | -10.1 |
| 22.1328125 | -12.2 |
| 22.140625 | -17 |
| 22.1484375 | -22.2 |
| 22.15625 | -22.8 |
| 22.1640625 | -22.4 |
| 22.171875 | -24 |
| 22.1796875 | -23.9 |
| 22.1875 | -25.8 |
| 22.1953125 | -33 |
| 22.203125 | -36.1 |
| 22.2109375 | -31.5 |
| 22.21875 | -29.7 |
| 22.2265625 | -32 |
| 22.234375 | -27.9 |
| 22.2421875 | -17.5 |
| 22.25 | -8.7 |
| 22.2578125 | 0.5 |
| 22.265625 | 11.7 |
| 22.2734375 | 17.4 |
| 22.28125 | 18.7 |
| 22.2890625 | 22.3 |
| 22.296875 | 24.8 |
| 22.3046875 | 23.4 |
| 22.3125 | 21.8 |
| 22.3203125 | 22.3 |
| 22.328125 | 24.3 |
| 22.3359375 | 23.6 |
| 22.34375 | 21.7 |
| 22.3515625 | 25 |
| 22.359375 | 27.2 |
| 22.3671875 | 22.5 |
| 22.375 | 18.3 |
| 22.3828125 | 18.4 |
| 22.390625 | 21.2 |
| 22.3984375 | 24.1 |
| 22.40625 | 20.7 |
| 22.4140625 | 13.1 |
| 22.421875 | 8.3 |
| 22.4296875 | 3.8 |
| 22.4375 | 1.6 |
| 22.4453125 | 5.8 |
| 22.453125 | 9.3 |
| 22.4609375 | 7.5 |
| 22.46875 | 5.3 |
| 22.4765625 | 4.9 |
| 22.484375 | 4.7 |
| 22.4921875 | -0.5 |
| 22.5 | -9.6 |
| 22.5078125 | -11.3 |
| 22.515625 | -8.2 |
| 22.5234375 | -13 |
| 22.53125 | -17.9 |
| 22.5390625 | -12.7 |
| 22.546875 | -9.6 |
| 22.5546875 | -15.2 |
| 22.5625 | -20.7 |
| 22.5703125 | -22.7 |
| 22.578125 | -21.9 |
| 22.5859375 | -18.6 |
| 22.59375 | -16.8 |
| 22.6015625 | -16.8 |
| 22.609375 | -14.8 |
| 22.6171875 | -11.5 |
| 22.625 | -10.6 |
| 22.6328125 | -9.8 |
| 22.640625 | -4.7 |
| 22.6484375 | 0.6 |
| 22.65625 | 2.3 |
| 22.6640625 | 4.5 |
| 22.671875 | 4.7 |
| 22.6796875 | 2 |
| 22.6875 | 5.3 |
| 22.6953125 | 9.7 |
| 22.703125 | 6.4 |
| 22.7109375 | 3.7 |
| 22.71875 | 5 |
| 22.7265625 | 8.2 |
| 22.734375 | 14.4 |
| 22.7421875 | 19.4 |
| 22.75 | 22.7 |
| 22.7578125 | 30.6 |
| 22.765625 | 39.8 |
| 22.7734375 | 44.5 |
| 22.78125 | 44.5 |
| 22.7890625 | 39.4 |
| 22.796875 | 29.5 |
| 22.8046875 | 18.8 |
| 22.8125 | 12.6 |
| 22.8203125 | 5.7 |
| 22.828125 | -11.4 |
| 22.8359375 | -31.4 |
| 22.84375 | -43.6 |
| 22.8515625 | -53.1 |
| 22.859375 | -63.6 |
| 22.8671875 | -70.2 |
| 22.875 | -69 |
| 22.8828125 | -60.9 |
| 22.890625 | -52.6 |
| 22.8984375 | -46.3 |
| 22.90625 | -37 |
| 22.9140625 | -24.6 |
| 22.921875 | -11.2 |
| 22.9296875 | 2.1 |
| 22.9375 | 11.8 |
| 22.9453125 | 18.1 |
| 22.953125 | 25.5 |
| 22.9609375 | 33.2 |
| 22.96875 | 38.3 |
| 22.9765625 | 39.3 |
| 22.984375 | 39 |
| 22.9921875 | 44.1 |
| 23.0 | 50.9 |
| 23.0078125 | 45.5 |
| 23.015625 | 28.7 |
| 23.0234375 | 14.1 |
| 23.03125 | 7.2 |
| 23.0390625 | 5.7 |
| 23.046875 | 8.1 |
| 23.0546875 | 14.2 |
| 23.0625 | 24.1 |
| 23.0703125 | 33.8 |
| 23.078125 | 36.1 |
| 23.0859375 | 32 |
| 23.09375 | 26.3 |
| 23.1015625 | 18 |
| 23.109375 | 14.8 |
| 23.1171875 | 27.7 |
| 23.125 | 45.4 |
| 23.1328125 | 52.1 |
| 23.140625 | 49.6 |
| 23.1484375 | 35.1 |
| 23.15625 | 8.4 |
| 23.1640625 | -9.1 |
| 23.171875 | -8.1 |
| 23.1796875 | -5.2 |
| 23.1875 | -7.4 |
| 23.1953125 | -8.1 |
| 23.203125 | -5.1 |
| 23.2109375 | -0.8 |
| 23.21875 | -1 |
| 23.2265625 | -7.3 |
| 23.234375 | -11.4 |
| 23.2421875 | -9.9 |
| 23.25 | -7.8 |
| 23.2578125 | -4.2 |
| 23.265625 | 5 |
| 23.2734375 | 15 |
| 23.28125 | 16.2 |
| 23.2890625 | 10.7 |
| 23.296875 | 5.4 |
| 23.3046875 | -2.9 |
| 23.3125 | -11.4 |
| 23.3203125 | -11.2 |
| 23.328125 | -9 |
| 23.3359375 | -10.1 |
| 23.34375 | -4.9 |
| 23.3515625 | 4.1 |
| 23.359375 | 5.1 |
| 23.3671875 | -1 |
| 23.375 | -7.9 |
| 23.3828125 | -10.9 |
| 23.390625 | -9.3 |
| 23.3984375 | -9.6 |
| 23.40625 | -13 |
| 23.4140625 | -9.5 |
| 23.421875 | 3.8 |
| 23.4296875 | 13.3 |
| 23.4375 | 11.5 |
| 23.4453125 | 5.9 |
| 23.453125 | -1.7 |
| 23.4609375 | -14.8 |
| 23.46875 | -27 |
| 23.4765625 | -32.2 |
| 23.484375 | -32 |
| 23.4921875 | -30.7 |
| 23.5 | -30.7 |
| 23.5078125 | -28 |
| 23.515625 | -27.9 |
| 23.5234375 | -38.7 |
| 23.53125 | -50 |
| 23.5390625 | -51.8 |
| 23.546875 | -49.5 |
| 23.5546875 | -44.7 |
| 23.5625 | -37.1 |
| 23.5703125 | -28.3 |
| 23.578125 | -17.8 |
| 23.5859375 | -11.4 |
| 23.59375 | -10.9 |
| 23.6015625 | -11.2 |
| 23.609375 | -13.3 |
| 23.6171875 | -15.2 |
| 23.625 | -13.3 |
| 23.6328125 | -12.7 |
| 23.640625 | -10.6 |
| 23.6484375 | -2.5 |
| 23.65625 | 6.2 |
| 23.6640625 | 15.6 |
| 23.671875 | 25.9 |
| 23.6796875 | 29.6 |
| 23.6875 | 28.3 |
| 23.6953125 | 24.6 |
| 23.703125 | 17.2 |
| 23.7109375 | 12.4 |
| 23.71875 | 12.2 |
| 23.7265625 | 8.6 |
| 23.734375 | 1.9 |
| 23.7421875 | -1.4 |
| 23.75 | -0.9 |
| 23.7578125 | 5.1 |
| 23.765625 | 16.6 |
| 23.7734375 | 20.7 |
| 23.78125 | 12.6 |
| 23.7890625 | 10.4 |
| 23.796875 | 18.2 |
| 23.8046875 | 18.6 |
| 23.8125 | 15.4 |
| 23.8203125 | 21.2 |
| 23.828125 | 25.8 |
| 23.8359375 | 24 |
| 23.84375 | 26.3 |
| 23.8515625 | 31.3 |
| 23.859375 | 28.8 |
| 23.8671875 | 21.4 |
| 23.875 | 15.6 |
| 23.8828125 | 9.8 |
| 23.890625 | 4.8 |
| 23.8984375 | 4.3 |
| 23.90625 | 2.5 |
| 23.9140625 | -2.6 |
| 23.921875 | -1.7 |
| 23.9296875 | 1.9 |
| 23.9375 | -1.9 |
| 23.9453125 | -6 |
| 23.953125 | -1.7 |
| 23.9609375 | 8 |
| 23.96875 | 18 |
| 23.9765625 | 23.7 |
| 23.984375 | 22.9 |
| 23.9921875 | 19.5 |
| 24.0 | 17.9 |
| 24.0078125 | 19.8 |
| 24.015625 | 21.7 |
| 24.0234375 | 19.4 |
| 24.03125 | 13.6 |
| 24.0390625 | 6.2 |
| 24.046875 | 2 |
| 24.0546875 | 5.4 |
| 24.0625 | 12 |
| 24.0703125 | 16.3 |
| 24.078125 | 17.7 |
| 24.0859375 | 16.5 |
| 24.09375 | 14.3 |
| 24.1015625 | 10.4 |
| 24.109375 | 2.4 |
| 24.1171875 | -5.6 |
| 24.125 | -8.9 |
| 24.1328125 | -11.9 |
| 24.140625 | -17.1 |
| 24.1484375 | -19.9 |
| 24.15625 | -16.4 |
| 24.1640625 | -11.2 |
| 24.171875 | -12.6 |
| 24.1796875 | -14.8 |
| 24.1875 | -6.4 |
| 24.1953125 | 4.8 |
| 24.203125 | 7.9 |
| 24.2109375 | 8.3 |
| 24.21875 | 9.8 |
| 24.2265625 | 12.7 |
| 24.234375 | 20.1 |
| 24.2421875 | 26.4 |
| 24.25 | 27 |
| 24.2578125 | 27.2 |
| 24.265625 | 29.3 |
| 24.2734375 | 30.6 |
| 24.28125 | 26.1 |
| 24.2890625 | 15.6 |
| 24.296875 | 9.5 |
| 24.3046875 | 8.4 |
| 24.3125 | 3.5 |
| 24.3203125 | 0.1 |
| 24.328125 | 2.1 |
| 24.3359375 | 1.6 |
| 24.34375 | -0.9 |
| 24.3515625 | -2.4 |
| 24.359375 | -7.2 |
| 24.3671875 | -14.2 |
| 24.375 | -16.9 |
| 24.3828125 | -13.1 |
| 24.390625 | -7.9 |
| 24.3984375 | -3.1 |
| 24.40625 | 5.8 |
| 24.4140625 | 13.4 |
| 24.421875 | 12.3 |
| 24.4296875 | 8.9 |
| 24.4375 | 5.8 |
| 24.4453125 | 2.3 |
| 24.453125 | 5.2 |
| 24.4609375 | 10.9 |
| 24.46875 | 10.8 |
| 24.4765625 | 12.4 |
| 24.484375 | 20.3 |
| 24.4921875 | 24.9 |
| 24.5 | 22.1 |
| 24.5078125 | 18 |
| 24.515625 | 13.9 |
| 24.5234375 | 6 |
| 24.53125 | -4.6 |
| 24.5390625 | -13.2 |
| 24.546875 | -18.5 |
| 24.5546875 | -23.1 |
| 24.5625 | -28.5 |
| 24.5703125 | -29 |
| 24.578125 | -22.2 |
| 24.5859375 | -15.4 |
| 24.59375 | -6.8 |
| 24.6015625 | 5.6 |
| 24.609375 | 12.6 |
| 24.6171875 | 17.8 |
| 24.625 | 29.4 |
| 24.6328125 | 40.3 |
| 24.640625 | 55.3 |
| 24.6484375 | 80.4 |
| 24.65625 | 101.3 |
| 24.6640625 | 115.8 |
| 24.671875 | 130.3 |
| 24.6796875 | 140.7 |
| 24.6875 | 152.3 |
| 24.6953125 | 165 |
| 24.703125 | 166.9 |
| 24.7109375 | 167.9 |
| 24.71875 | 174.3 |
| 24.7265625 | 168.3 |
| 24.734375 | 150.6 |
| 24.7421875 | 137.6 |
| 24.75 | 128.7 |
| 24.7578125 | 113.8 |
| 24.765625 | 79.8 |
| 24.7734375 | 23.2 |
| 24.78125 | -36.3 |
| 24.7890625 | -84.8 |
| 24.796875 | -123.2 |
| 24.8046875 | -148.4 |
| 24.8125 | -162.5 |
| 24.8203125 | -165.5 |
| 24.828125 | -148 |
| 24.8359375 | -120.5 |
| 24.84375 | -94.5 |
| 24.8515625 | -61.7 |
| 24.859375 | -31.2 |
| 24.8671875 | -17.1 |
| 24.875 | -5.5 |
| 24.8828125 | 10.1 |
| 24.890625 | 17 |
| 24.8984375 | 8 |
| 24.90625 | -15.4 |
| 24.9140625 | -41.7 |
| 24.921875 | -62.7 |
| 24.9296875 | -86.3 |
| 24.9375 | -116 |
| 24.9453125 | -147.5 |
| 24.953125 | -179.4 |
| 24.9609375 | -203.9 |
| 24.96875 | -207.2 |
| 24.9765625 | -189.6 |
| 24.984375 | -165.3 |
| 24.9921875 | -141.6 |
| 25.0 | -115.8 |
| 25.0078125 | -90.3 |
| 25.015625 | -72.2 |
| 25.0234375 | -61.1 |
| 25.03125 | -56.6 |
| 25.0390625 | -60.2 |
| 25.046875 | -62.1 |
| 25.0546875 | -57.1 |
| 25.0625 | -57.1 |
| 25.0703125 | -65.7 |
| 25.078125 | -73.4 |
| 25.0859375 | -78.9 |
| 25.09375 | -84.3 |
| 25.1015625 | -88.3 |
| 25.109375 | -89.7 |
| 25.1171875 | -88.6 |
| 25.125 | -87.9 |
| 25.1328125 | -89.8 |
| 25.140625 | -92.8 |
| 25.1484375 | -99.4 |
| 25.15625 | -106.3 |
| 25.1640625 | -104.4 |
| 25.171875 | -102.5 |
| 25.1796875 | -112 |
| 25.1875 | -123.2 |
| 25.1953125 | -125.5 |
| 25.203125 | -121.4 |
| 25.2109375 | -113.6 |
| 25.21875 | -102.8 |
| 25.2265625 | -92.1 |
| 25.234375 | -85 |
| 25.2421875 | -79.6 |
| 25.25 | -75.1 |
| 25.2578125 | -73.1 |
| 25.265625 | -69.4 |
| 25.2734375 | -62.1 |
| 25.28125 | -57.2 |
| 25.2890625 | -53.2 |
| 25.296875 | -48.7 |
| 25.3046875 | -46.8 |
| 25.3125 | -43.3 |
| 25.3203125 | -40.6 |
| 25.328125 | -43.1 |
| 25.3359375 | -39.4 |
| 25.34375 | -28.3 |
| 25.3515625 | -20.8 |
| 25.359375 | -13.8 |
| 25.3671875 | -4.9 |
| 25.375 | 2.5 |
| 25.3828125 | 10.1 |
| 25.390625 | 14.1 |
| 25.3984375 | 17 |
| 25.40625 | 27.9 |
| 25.4140625 | 40.6 |
| 25.421875 | 51.9 |
| 25.4296875 | 65 |
| 25.4375 | 72.4 |
| 25.4453125 | 75.3 |
| 25.453125 | 78.9 |
| 25.4609375 | 79.6 |
| 25.46875 | 83.5 |
| 25.4765625 | 93.4 |
| 25.484375 | 99.2 |
| 25.4921875 | 104.6 |
| 25.5 | 112.1 |
| 25.5078125 | 113.9 |
| 25.515625 | 114.9 |
| 25.5234375 | 118.8 |
| 25.53125 | 118.4 |
| 25.5390625 | 116.7 |
| 25.546875 | 117.8 |
| 25.5546875 | 121.9 |
| 25.5625 | 132.7 |
| 25.5703125 | 144.1 |
| 25.578125 | 147.2 |
| 25.5859375 | 145.2 |
| 25.59375 | 140.4 |
| 25.6015625 | 132.9 |
| 25.609375 | 125 |
| 25.6171875 | 119.7 |
| 25.625 | 120.4 |
| 25.6328125 | 121.3 |
| 25.640625 | 120.8 |
| 25.6484375 | 128.8 |
| 25.65625 | 135.2 |
| 25.6640625 | 129.6 |
| 25.671875 | 127.9 |
| 25.6796875 | 128.5 |
| 25.6875 | 120.9 |
| 25.6953125 | 119.2 |
| 25.703125 | 122 |
| 25.7109375 | 114.3 |
| 25.71875 | 105.4 |
| 25.7265625 | 100.8 |
| 25.734375 | 92.9 |
| 25.7421875 | 85.4 |
| 25.75 | 83.8 |
| 25.7578125 | 85.4 |
| 25.765625 | 86.7 |
| 25.7734375 | 84.9 |
| 25.78125 | 80.7 |
| 25.7890625 | 76.9 |
| 25.796875 | 71.8 |
| 25.8046875 | 63.7 |
| 25.8125 | 57.7 |
| 25.8203125 | 51.9 |
| 25.828125 | 35.5 |
| 25.8359375 | 13.3 |
| 25.84375 | -0.2 |
| 25.8515625 | -9.5 |
| 25.859375 | -20.6 |
| 25.8671875 | -26 |
| 25.875 | -30.4 |
| 25.8828125 | -41.4 |
| 25.890625 | -48.4 |
| 25.8984375 | -47.8 |
| 25.90625 | -47 |
| 25.9140625 | -47.6 |
| 25.921875 | -52.1 |
| 25.9296875 | -58.5 |
| 25.9375 | -56.9 |
| 25.9453125 | -49.3 |
| 25.953125 | -45.4 |
| 25.9609375 | -41.4 |
| 25.96875 | -33.8 |
| 25.9765625 | -28.3 |
| 25.984375 | -23.5 |
| 25.9921875 | -16.6 |
| 26.0 | -13.4 |
| 26.0078125 | -13.5 |
| 26.015625 | -10.4 |
| 26.0234375 | -2.9 |
| 26.03125 | 5.7 |
| 26.0390625 | 10.1 |
| 26.046875 | 9.1 |
| 26.0546875 | 4.3 |
| 26.0625 | -5.9 |
| 26.0703125 | -12.6 |
| 26.078125 | -6 |
| 26.0859375 | 1.5 |
| 26.09375 | 3.1 |
| 26.1015625 | 5.5 |
| 26.109375 | 4.7 |
| 26.1171875 | 4.2 |
| 26.125 | 10.6 |
| 26.1328125 | 11.4 |
| 26.140625 | 4.9 |
| 26.1484375 | -1.5 |
| 26.15625 | -11.9 |
| 26.1640625 | -17 |
| 26.171875 | -7.3 |
| 26.1796875 | -0.5 |
| 26.1875 | -5.6 |
| 26.1953125 | -6.2 |
| 26.203125 | 1 |
| 26.2109375 | 3.1 |
| 26.21875 | -1.8 |
| 26.2265625 | -6.6 |
| 26.234375 | -10.6 |
| 26.2421875 | -15.3 |
| 26.25 | -19.1 |
| 26.2578125 | -19.8 |
| 26.265625 | -16.5 |
| 26.2734375 | -13.2 |
| 26.28125 | -16.5 |
| 26.2890625 | -24.7 |
| 26.296875 | -32.2 |
| 26.3046875 | -39.4 |
| 26.3125 | -47.5 |
| 26.3203125 | -54.8 |
| 26.328125 | -59.9 |
| 26.3359375 | -63.3 |
| 26.34375 | -64.7 |
| 26.3515625 | -64.1 |
| 26.359375 | -63.6 |
| 26.3671875 | -64.1 |
| 26.375 | -64.3 |
| 26.3828125 | -61.9 |
| 26.390625 | -53.9 |
| 26.3984375 | -42 |
| 26.40625 | -35.3 |
| 26.4140625 | -36.3 |
| 26.421875 | -39.8 |
| 26.4296875 | -42.2 |
| 26.4375 | -38.5 |
| 26.4453125 | -30.2 |
| 26.453125 | -28.3 |
| 26.4609375 | -33.9 |
| 26.46875 | -41.1 |
| 26.4765625 | -47.9 |
| 26.484375 | -49.4 |
| 26.4921875 | -48.2 |
| 26.5 | -52.7 |
| 26.5078125 | -57.5 |
| 26.515625 | -59.1 |
| 26.5234375 | -60.4 |
| 26.53125 | -56.9 |
| 26.5390625 | -52.1 |
| 26.546875 | -51 |
| 26.5546875 | -45.4 |
| 26.5625 | -37.2 |
| 26.5703125 | -34.9 |
| 26.578125 | -34.2 |
| 26.5859375 | -34.5 |
| 26.59375 | -36 |
| 26.6015625 | -32.1 |
| 26.609375 | -27.2 |
| 26.6171875 | -25.8 |
| 26.625 | -20.5 |
| 26.6328125 | -13 |
| 26.640625 | -11.2 |
| 26.6484375 | -14.3 |
| 26.65625 | -18.8 |
| 26.6640625 | -21.4 |
| 26.671875 | -18.7 |
| 26.6796875 | -16.8 |
| 26.6875 | -19.5 |
| 26.6953125 | -17.4 |
| 26.703125 | -8 |
| 26.7109375 | 0.9 |
| 26.71875 | 9.7 |
| 26.7265625 | 17.3 |
| 26.734375 | 17.1 |
| 26.7421875 | 14.9 |
| 26.75 | 16.3 |
| 26.7578125 | 16.7 |
| 26.765625 | 15.9 |
| 26.7734375 | 11.8 |
| 26.78125 | 3.8 |
| 26.7890625 | 3.6 |
| 26.796875 | 9.8 |
| 26.8046875 | 11.1 |
| 26.8125 | 9.7 |
| 26.8203125 | 8 |
| 26.828125 | 7.8 |
| 26.8359375 | 13.8 |
| 26.84375 | 17.8 |
| 26.8515625 | 16.8 |
| 26.859375 | 19.8 |
| 26.8671875 | 20.9 |
| 26.875 | 16 |
| 26.8828125 | 14.5 |
| 26.890625 | 16.2 |
| 26.8984375 | 16.9 |
| 26.90625 | 18 |
| 26.9140625 | 17.4 |
| 26.921875 | 15.3 |
| 26.9296875 | 13.5 |
| 26.9375 | 10.1 |
| 26.9453125 | 9.5 |
| 26.953125 | 14.6 |
| 26.9609375 | 19.4 |
| 26.96875 | 22.5 |
| 26.9765625 | 27.7 |
| 26.984375 | 34.4 |
| 26.9921875 | 37.5 |
| 27.0 | 36.1 |
| 27.0078125 | 34.4 |
| 27.015625 | 31.9 |
| 27.0234375 | 25.1 |
| 27.03125 | 20.9 |
| 27.0390625 | 24.8 |
| 27.046875 | 27.4 |
| 27.0546875 | 20.2 |
| 27.0625 | 10.5 |
| 27.0703125 | 5.7 |
| 27.078125 | 1.9 |
| 27.0859375 | -0.6 |
| 27.09375 | 2.6 |
| 27.1015625 | 4.1 |
| 27.109375 | -0.4 |
| 27.1171875 | -2.2 |
| 27.125 | 0.1 |
| 27.1328125 | 0.2 |
| 27.140625 | -2.5 |
| 27.1484375 | -6 |
| 27.15625 | -9.1 |
| 27.1640625 | -12 |
| 27.171875 | -13.6 |
| 27.1796875 | -8.8 |
| 27.1875 | -2.3 |
| 27.1953125 | -3.6 |
| 27.203125 | -7 |
| 27.2109375 | -5.8 |
| 27.21875 | -5.1 |
| 27.2265625 | -4.2 |
| 27.234375 | 1.9 |
| 27.2421875 | 7.4 |
| 27.25 | 8.4 |
| 27.2578125 | 9.4 |
| 27.265625 | 10.4 |
| 27.2734375 | 12.3 |
| 27.28125 | 16.2 |
| 27.2890625 | 14.7 |
| 27.296875 | 10.7 |
| 27.3046875 | 16.6 |
| 27.3125 | 28.1 |
| 27.3203125 | 33.5 |
| 27.328125 | 34.5 |
| 27.3359375 | 37.6 |
| 27.34375 | 39.9 |
| 27.3515625 | 36.2 |
| 27.359375 | 30.4 |
| 27.3671875 | 24.4 |
| 27.375 | 14.4 |
| 27.3828125 | 2.1 |
| 27.390625 | -9.8 |
| 27.3984375 | -18.1 |
| 27.40625 | -19.7 |
| 27.4140625 | -22.6 |
| 27.421875 | -30 |
| 27.4296875 | -32.9 |
| 27.4375 | -29.5 |
| 27.4453125 | -22.7 |
| 27.453125 | -19.3 |
| 27.4609375 | -24.4 |
| 27.46875 | -26.3 |
| 27.4765625 | -22.3 |
| 27.484375 | -21.5 |
| 27.4921875 | -16.2 |
| 27.5 | -4.9 |
| 27.5078125 | 1.9 |
| 27.515625 | 6.8 |
| 27.5234375 | 11.5 |
| 27.53125 | 14.3 |
| 27.5390625 | 20 |
| 27.546875 | 27 |
| 27.5546875 | 32 |
| 27.5625 | 35.9 |
| 27.5703125 | 36.7 |
| 27.578125 | 34.8 |
| 27.5859375 | 30.1 |
| 27.59375 | 21.8 |
| 27.6015625 | 15.5 |
| 27.609375 | 11.5 |
| 27.6171875 | 5.7 |
| 27.625 | 0.5 |
| 27.6328125 | -0.8 |
| 27.640625 | 3.5 |
| 27.6484375 | 12.2 |
| 27.65625 | 17.6 |
| 27.6640625 | 17.4 |
| 27.671875 | 17.5 |
| 27.6796875 | 19.7 |
| 27.6875 | 23 |
| 27.6953125 | 26.5 |
| 27.703125 | 27.2 |
| 27.7109375 | 24.4 |
| 27.71875 | 18.6 |
| 27.7265625 | 7.5 |
| 27.734375 | -6.6 |
| 27.7421875 | -15.3 |
| 27.75 | -17.1 |
| 27.7578125 | -21.5 |
| 27.765625 | -32.6 |
| 27.7734375 | -43.8 |
| 27.78125 | -50.1 |
| 27.7890625 | -53.6 |
| 27.796875 | -55.4 |
| 27.8046875 | -55.1 |
| 27.8125 | -51.8 |
| 27.8203125 | -45.5 |
| 27.828125 | -39.2 |
| 27.8359375 | -36.1 |
| 27.84375 | -34.3 |
| 27.8515625 | -29 |
| 27.859375 | -20 |
| 27.8671875 | -13.4 |
| 27.875 | -13.7 |
| 27.8828125 | -16.7 |
| 27.890625 | -19.6 |
| 27.8984375 | -22.2 |
| 27.90625 | -22 |
| 27.9140625 | -21.6 |
| 27.921875 | -25.1 |
| 27.9296875 | -28.5 |
| 27.9375 | -30.3 |
| 27.9453125 | -33 |
| 27.953125 | -33.7 |
| 27.9609375 | -30.1 |
| 27.96875 | -26.7 |
| 27.9765625 | -25.5 |
| 27.984375 | -25 |
| 27.9921875 | -26.8 |
| 28.0 | -30 |
| 28.0078125 | -28.6 |
| 28.015625 | -24.2 |
| 28.0234375 | -19.8 |
| 28.03125 | -13 |
| 28.0390625 | -4.7 |
| 28.046875 | 5.4 |
| 28.0546875 | 16.2 |
| 28.0625 | 17.9 |
| 28.0703125 | 13.6 |
| 28.078125 | 14.3 |
| 28.0859375 | 15.4 |
| 28.09375 | 15.4 |
| 28.1015625 | 20.4 |
| 28.109375 | 26.9 |
| 28.1171875 | 28.6 |
| 28.125 | 24.1 |
| 28.1328125 | 22.2 |
| 28.140625 | 25.6 |
| 28.1484375 | 23.5 |
| 28.15625 | 21.2 |
| 28.1640625 | 26.1 |
| 28.171875 | 25.1 |
| 28.1796875 | 21.3 |
| 28.1875 | 24.9 |
| 28.1953125 | 26.9 |
| 28.203125 | 27.2 |
| 28.2109375 | 31.9 |
| 28.21875 | 35.2 |
| 28.2265625 | 38.3 |
| 28.234375 | 47.2 |
| 28.2421875 | 58.3 |
| 28.25 | 63 |
| 28.2578125 | 60.2 |
| 28.265625 | 54.9 |
| 28.2734375 | 43.1 |
| 28.28125 | 20.8 |
| 28.2890625 | -2.1 |
| 28.296875 | -18.2 |
| 28.3046875 | -28 |
| 28.3125 | -33 |
| 28.3203125 | -34.1 |
| 28.328125 | -32.4 |
| 28.3359375 | -31.8 |
| 28.34375 | -32.3 |
| 28.3515625 | -29.5 |
| 28.359375 | -27.7 |
| 28.3671875 | -28.3 |
| 28.375 | -25.8 |
| 28.3828125 | -23.2 |
| 28.390625 | -20.2 |
| 28.3984375 | -13.2 |
| 28.40625 | -9.9 |
| 28.4140625 | -12.3 |
| 28.421875 | -11 |
| 28.4296875 | -4.8 |
| 28.4375 | 0.4 |
| 28.4453125 | 3.3 |
| 28.453125 | 6.7 |
| 28.4609375 | 8.8 |
| 28.46875 | 10.3 |
| 28.4765625 | 20 |
| 28.484375 | 29.5 |
| 28.4921875 | 22.9 |
| 28.5 | 11.9 |
| 28.5078125 | 7.4 |
| 28.515625 | 1 |
| 28.5234375 | -4.8 |
| 28.53125 | -7.1 |
| 28.5390625 | -7.9 |
| 28.546875 | -2.1 |
| 28.5546875 | 4.1 |
| 28.5625 | 2.3 |
| 28.5703125 | -0.3 |
| 28.578125 | -2.7 |
| 28.5859375 | -7.2 |
| 28.59375 | -5.3 |
| 28.6015625 | 3.3 |
| 28.609375 | 12.2 |
| 28.6171875 | 19.8 |
| 28.625 | 25.3 |
| 28.6328125 | 25.4 |
| 28.640625 | 20.7 |
| 28.6484375 | 17.9 |
| 28.65625 | 16.6 |
| 28.6640625 | 8.2 |
| 28.671875 | -3.5 |
| 28.6796875 | -8.7 |
| 28.6875 | -7.5 |
| 28.6953125 | -2.5 |
| 28.703125 | 4 |
| 28.7109375 | 7.3 |
| 28.71875 | 8.7 |
| 28.7265625 | 8.7 |
| 28.734375 | 4.8 |
| 28.7421875 | 0.6 |
| 28.75 | 1.1 |
| 28.7578125 | 4.5 |
| 28.765625 | 7.6 |
| 28.7734375 | 11.1 |
| 28.78125 | 19.1 |
| 28.7890625 | 29 |
| 28.796875 | 31.5 |
| 28.8046875 | 25.1 |
| 28.8125 | 15.2 |
| 28.8203125 | 8.9 |
| 28.828125 | 10.7 |
| 28.8359375 | 12.9 |
| 28.84375 | 6.8 |
| 28.8515625 | -0.3 |
| 28.859375 | 1.1 |
| 28.8671875 | 8.5 |
| 28.875 | 14 |
| 28.8828125 | 14.1 |
| 28.890625 | 7.9 |
| 28.8984375 | -1.3 |
| 28.90625 | -3.9 |
| 28.9140625 | -0.1 |
| 28.921875 | 1.8 |
| 28.9296875 | 8.1 |
| 28.9375 | 20.3 |
| 28.9453125 | 27 |
| 28.953125 | 28.6 |
| 28.9609375 | 25.1 |
| 28.96875 | 12.4 |
| 28.9765625 | 2.9 |
| 28.984375 | 1.5 |
| 28.9921875 | -1 |
| 29.0 | -1.9 |
| 29.0078125 | 2.3 |
| 29.015625 | 5.5 |
| 29.0234375 | 7.4 |
| 29.03125 | 12.4 |
| 29.0390625 | 18.6 |
| 29.046875 | 18.3 |
| 29.0546875 | 10.7 |
| 29.0625 | 3.5 |
| 29.0703125 | -0.5 |
| 29.078125 | -0.3 |
| 29.0859375 | 3.3 |
| 29.09375 | 4 |
| 29.1015625 | 5.5 |
| 29.109375 | 12.9 |
| 29.1171875 | 13.6 |
| 29.125 | 4.2 |
| 29.1328125 | -2.3 |
| 29.140625 | -8.5 |
| 29.1484375 | -19.7 |
| 29.15625 | -24.9 |
| 29.1640625 | -20.9 |
| 29.171875 | -13.5 |
| 29.1796875 | -0.6 |
| 29.1875 | 12.9 |
| 29.1953125 | 17 |
| 29.203125 | 13.6 |
| 29.2109375 | 6.4 |
| 29.21875 | -2.7 |
| 29.2265625 | -11.1 |
| 29.234375 | -18.3 |
| 29.2421875 | -21.8 |
| 29.25 | -20.3 |
| 29.2578125 | -14.9 |
| 29.265625 | -4.6 |
| 29.2734375 | 2.9 |
| 29.28125 | -0.2 |
| 29.2890625 | -7.4 |
| 29.296875 | -13.6 |
| 29.3046875 | -20.8 |
| 29.3125 | -25.9 |
| 29.3203125 | -24.4 |
| 29.328125 | -18.1 |
| 29.3359375 | -11.4 |
| 29.34375 | -2.9 |
| 29.3515625 | 8.2 |
| 29.359375 | 12.6 |
| 29.3671875 | 5.2 |
| 29.375 | -7.6 |
| 29.3828125 | -18.1 |
| 29.390625 | -20.4 |
| 29.3984375 | -15.6 |
| 29.40625 | -5.5 |
| 29.4140625 | 12.3 |
| 29.421875 | 28.5 |
| 29.4296875 | 34.5 |
| 29.4375 | 37.4 |
| 29.4453125 | 35.1 |
| 29.453125 | 21 |
| 29.4609375 | 7.2 |
| 29.46875 | 1.6 |
| 29.4765625 | -1.5 |
| 29.484375 | -1.7 |
| 29.4921875 | 4.7 |
| 29.5 | 16 |
| 29.5078125 | 29.1 |
| 29.515625 | 37.6 |
| 29.5234375 | 35.8 |
| 29.53125 | 27.6 |
| 29.5390625 | 20.2 |
| 29.546875 | 13.9 |
| 29.5546875 | 9 |
| 29.5625 | 10.8 |
| 29.5703125 | 18.4 |
| 29.578125 | 25.5 |
| 29.5859375 | 32.1 |
| 29.59375 | 41.2 |
| 29.6015625 | 48.5 |
| 29.609375 | 43.9 |
| 29.6171875 | 28.2 |
| 29.625 | 18.6 |
| 29.6328125 | 19.9 |
| 29.640625 | 19.8 |
| 29.6484375 | 21.2 |
| 29.65625 | 33.8 |
| 29.6640625 | 44.3 |
| 29.671875 | 41.5 |
| 29.6796875 | 39 |
| 29.6875 | 41.4 |
| 29.6953125 | 36.3 |
| 29.703125 | 26.1 |
| 29.7109375 | 20.3 |
| 29.71875 | 14.6 |
| 29.7265625 | 6.4 |
| 29.734375 | -0.4 |
| 29.7421875 | -8 |
| 29.75 | -16.5 |
| 29.7578125 | -20.3 |
| 29.765625 | -21.7 |
| 29.7734375 | -27.4 |
| 29.78125 | -38.9 |
| 29.7890625 | -52.9 |
| 29.796875 | -64.7 |
| 29.8046875 | -73.4 |
| 29.8125 | -81.5 |
| 29.8203125 | -86.2 |
| 29.828125 | -87.4 |
| 29.8359375 | -92.2 |
| 29.84375 | -100.4 |
| 29.8515625 | -107.5 |
| 29.859375 | -115.2 |
| 29.8671875 | -120.2 |
| 29.875 | -120.1 |
| 29.8828125 | -122 |
| 29.890625 | -123 |
| 29.8984375 | -116.5 |
| 29.90625 | -110.1 |
| 29.9140625 | -104.1 |
| 29.921875 | -92.7 |
| 29.9296875 | -83.4 |
| 29.9375 | -78.2 |
| 29.9453125 | -70 |
| 29.953125 | -61.7 |
| 29.9609375 | -56.8 |
| 29.96875 | -50.5 |
| 29.9765625 | -40.9 |
| 29.984375 | -31.7 |
| 29.9921875 | -23.3 |
| 30.0 | -13.6 |
| 30.0078125 | -4.6 |
| 30.015625 | 1.7 |
| 30.0234375 | 8.7 |
| 30.03125 | 16 |
| 30.0390625 | 20 |
| 30.046875 | 19.9 |
| 30.0546875 | 13.2 |
| 30.0625 | 4.1 |
| 30.0703125 | 2.2 |
| 30.078125 | 3.3 |
| 30.0859375 | 3.5 |
| 30.09375 | 9.4 |
| 30.1015625 | 15.4 |
| 30.109375 | 13.6 |
| 30.1171875 | 13.9 |
| 30.125 | 18.1 |
| 30.1328125 | 17.3 |
| 30.140625 | 17.8 |
| 30.1484375 | 23.8 |
| 30.15625 | 24.4 |
| 30.1640625 | 20.4 |
| 30.171875 | 22 |
| 30.1796875 | 25.6 |
| 30.1875 | 26.6 |
| 30.1953125 | 31.8 |
| 30.203125 | 38.2 |
| 30.2109375 | 36.4 |
| 30.21875 | 31 |
| 30.2265625 | 31 |
| 30.234375 | 37.4 |
| 30.2421875 | 45.3 |
| 30.25 | 46.8 |
| 30.2578125 | 42.9 |
| 30.265625 | 44 |
| 30.2734375 | 51 |
| 30.28125 | 59.3 |
| 30.2890625 | 68.2 |
| 30.296875 | 72.5 |
| 30.3046875 | 68.4 |
| 30.3125 | 62.3 |
| 30.3203125 | 57.6 |
| 30.328125 | 51.6 |
| 30.3359375 | 44.3 |
| 30.34375 | 37.1 |
| 30.3515625 | 28.5 |
| 30.359375 | 20.6 |
| 30.3671875 | 16.5 |
| 30.375 | 11.8 |
| 30.3828125 | 4.9 |
| 30.390625 | 2.9 |
| 30.3984375 | 5.3 |
| 30.40625 | 4.5 |
| 30.4140625 | 4.2 |
| 30.421875 | 10.8 |
| 30.4296875 | 18.6 |
| 30.4375 | 20.6 |
| 30.4453125 | 19.1 |
| 30.453125 | 19.9 |
| 30.4609375 | 20.7 |
| 30.46875 | 16.2 |
| 30.4765625 | 10.7 |
| 30.484375 | 9.7 |
| 30.4921875 | 10.3 |
| 30.5 | 11.5 |
| 30.5078125 | 15.3 |
| 30.515625 | 19 |
| 30.5234375 | 18.2 |
| 30.53125 | 10.7 |
| 30.5390625 | 0.4 |
| 30.546875 | -2.8 |
| 30.5546875 | -2.2 |
| 30.5625 | -8.9 |
| 30.5703125 | -15.6 |
| 30.578125 | -14.6 |
| 30.5859375 | -16.4 |
| 30.59375 | -18.6 |
| 30.6015625 | -10.1 |
| 30.609375 | -1.6 |
| 30.6171875 | -1.5 |
| 30.625 | -3.9 |
| 30.6328125 | -7.3 |
| 30.640625 | -9.4 |
| 30.6484375 | -9.3 |
| 30.65625 | -10.5 |
| 30.6640625 | -9.1 |
| 30.671875 | -4.9 |
| 30.6796875 | -2.8 |
| 30.6875 | -1.8 |
| 30.6953125 | -0.3 |
| 30.703125 | 1.6 |
| 30.7109375 | 2.2 |
| 30.71875 | 1.3 |
| 30.7265625 | 3.2 |
| 30.734375 | 1.6 |
| 30.7421875 | -4.2 |
| 30.75 | -0.4 |
| 30.7578125 | 4.1 |
| 30.765625 | -3.1 |
| 30.7734375 | -10.3 |
| 30.78125 | -16.2 |
| 30.7890625 | -25.1 |
| 30.796875 | -30.4 |
| 30.8046875 | -35.9 |
| 30.8125 | -43.7 |
| 30.8203125 | -45.3 |
| 30.828125 | -44.4 |
| 30.8359375 | -47.2 |
| 30.84375 | -45.7 |
| 30.8515625 | -38 |
| 30.859375 | -36 |
| 30.8671875 | -41 |
| 30.875 | -41.7 |
| 30.8828125 | -40.7 |
| 30.890625 | -45.5 |
| 30.8984375 | -47.6 |
| 30.90625 | -45.4 |
| 30.9140625 | -46.1 |
| 30.921875 | -45.4 |
| 30.9296875 | -41.8 |
| 30.9375 | -37.7 |
| 30.9453125 | -29.7 |
| 30.953125 | -19.9 |
| 30.9609375 | -9.9 |
| 30.96875 | 1.4 |
| 30.9765625 | 6.6 |
| 30.984375 | 9.6 |
| 30.9921875 | 16.7 |
| 31.0 | 16.5 |
| 31.0078125 | 9.3 |
| 31.015625 | 3 |
| 31.0234375 | -4.3 |
| 31.03125 | -6.9 |
| 31.0390625 | -6.8 |
| 31.046875 | -11.4 |
| 31.0546875 | -11.9 |
| 31.0625 | -10.3 |
| 31.0703125 | -13.9 |
| 31.078125 | -12 |
| 31.0859375 | -6 |
| 31.09375 | -2.9 |
| 31.1015625 | 4 |
| 31.109375 | 10.9 |
| 31.1171875 | 15.2 |
| 31.125 | 24.2 |
| 31.1328125 | 32.4 |
| 31.140625 | 34.9 |
| 31.1484375 | 36.5 |
| 31.15625 | 38 |
| 31.1640625 | 38.7 |
| 31.171875 | 38 |
| 31.1796875 | 35.8 |
| 31.1875 | 35.8 |
| 31.1953125 | 35.6 |
| 31.203125 | 32.2 |
| 31.2109375 | 29.1 |
| 31.21875 | 26.7 |
| 31.2265625 | 24.3 |
| 31.234375 | 22.8 |
| 31.2421875 | 17.4 |
| 31.25 | 5.8 |
| 31.2578125 | -2.9 |
| 31.265625 | -1.5 |
| 31.2734375 | 2.7 |
| 31.28125 | -0.3 |
| 31.2890625 | -5 |
| 31.296875 | -4.9 |
| 31.3046875 | -7.6 |
| 31.3125 | -15.9 |
| 31.3203125 | -21.8 |
| 31.328125 | -24.1 |
| 31.3359375 | -23.9 |
| 31.34375 | -19.2 |
| 31.3515625 | -13.4 |
| 31.359375 | -8.3 |
| 31.3671875 | -0.7 |
| 31.375 | 4.6 |
| 31.3828125 | 4.4 |
| 31.390625 | 7.1 |
| 31.3984375 | 16.6 |
| 31.40625 | 27.3 |
| 31.4140625 | 34.4 |
| 31.421875 | 38.3 |
| 31.4296875 | 44.9 |
| 31.4375 | 52.5 |
| 31.4453125 | 55.6 |
| 31.453125 | 58.8 |
| 31.4609375 | 63.2 |
| 31.46875 | 63.8 |
| 31.4765625 | 64.9 |
| 31.484375 | 67.5 |
| 31.4921875 | 67.6 |
| 31.5 | 68.1 |
| 31.5078125 | 71.2 |
| 31.515625 | 73.6 |
| 31.5234375 | 70.7 |
| 31.53125 | 63.3 |
| 31.5390625 | 55.9 |
| 31.546875 | 46.4 |
| 31.5546875 | 37.6 |
| 31.5625 | 35.8 |
| 31.5703125 | 34.6 |
| 31.578125 | 32.1 |
| 31.5859375 | 32.6 |
| 31.59375 | 30.1 |
| 31.6015625 | 24.7 |
| 31.609375 | 22.2 |
| 31.6171875 | 20.8 |
| 31.625 | 20.6 |
| 31.6328125 | 20.2 |
| 31.640625 | 15.9 |
| 31.6484375 | 8.7 |
| 31.65625 | -1.5 |
| 31.6640625 | -10.8 |
| 31.671875 | -16 |
| 31.6796875 | -24.6 |
| 31.6875 | -34.1 |
| 31.6953125 | -36.7 |
| 31.703125 | -38.2 |
| 31.7109375 | -39.8 |
| 31.71875 | -36.2 |
| 31.7265625 | -29.1 |
| 31.734375 | -20.9 |
| 31.7421875 | -17.3 |
| 31.75 | -21.4 |
| 31.7578125 | -22.4 |
| 31.765625 | -20.2 |
| 31.7734375 | -24.2 |
| 31.78125 | -27 |
| 31.7890625 | -23.4 |
| 31.796875 | -23.1 |
| 31.8046875 | -24.9 |
| 31.8125 | -23.1 |
| 31.8203125 | -21.3 |
| 31.828125 | -18 |
| 31.8359375 | -11.9 |
| 31.84375 | -10.4 |
| 31.8515625 | -8.8 |
| 31.859375 | 2.7 |
| 31.8671875 | 14.6 |
| 31.875 | 13.9 |
| 31.8828125 | 3.8 |
| 31.890625 | -5.1 |
| 31.8984375 | -9.3 |
| 31.90625 | -14.5 |
| 31.9140625 | -23.1 |
| 31.921875 | -28.5 |
| 31.9296875 | -30.4 |
| 31.9375 | -35.1 |
| 31.9453125 | -42.5 |
| 31.953125 | -48.5 |
| 31.9609375 | -53.2 |
| 31.96875 | -57.8 |
| 31.9765625 | -56.4 |
| 31.984375 | -47.1 |
| 31.9921875 | -36.2 |